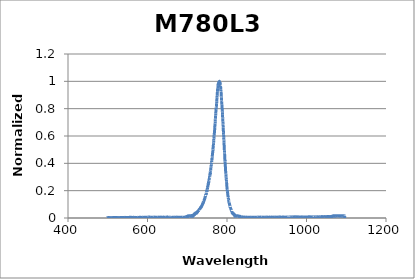
| Category | Normalized Intensity |
|---|---|
| 498.55860471 | 0.002 |
| 498.71212789 | 0.002 |
| 498.86566035 | 0.002 |
| 499.01920208 | 0.002 |
| 499.17275308 | 0.002 |
| 499.32631335 | 0.001 |
| 499.47988288 | 0.001 |
| 499.63346167 | 0.001 |
| 499.78704972 | 0.002 |
| 499.94064703 | 0.002 |
| 500.0942536 | 0.001 |
| 500.24786941 | 0.001 |
| 500.40149447 | 0.002 |
| 500.55512877 | 0.001 |
| 500.70877232 | 0.002 |
| 500.8624251 | 0.002 |
| 501.01608712 | 0.003 |
| 501.16975838 | 0.002 |
| 501.32343886 | 0.002 |
| 501.47712857 | 0.002 |
| 501.63082751 | 0.002 |
| 501.78453567 | 0.002 |
| 501.93825305 | 0.003 |
| 502.09197964 | 0.001 |
| 502.24571545 | 0.002 |
| 502.39946046 | 0.002 |
| 502.55321469 | 0.002 |
| 502.70697812 | 0.001 |
| 502.86075075 | 0.003 |
| 503.01453258 | 0.002 |
| 503.1683236 | 0.002 |
| 503.32212382 | 0.001 |
| 503.47593323 | 0.002 |
| 503.62975183 | 0.001 |
| 503.78357961 | 0.002 |
| 503.93741657 | 0.002 |
| 504.09126271 | 0.003 |
| 504.24511803 | 0.001 |
| 504.39898252 | 0.002 |
| 504.55285618 | 0.002 |
| 504.70673901 | 0.002 |
| 504.860631 | 0.001 |
| 505.01453216 | 0.003 |
| 505.16844247 | 0.002 |
| 505.32236194 | 0.003 |
| 505.47629056 | 0.001 |
| 505.63022834 | 0.003 |
| 505.78417526 | 0.002 |
| 505.93813132 | 0.001 |
| 506.09209653 | 0.002 |
| 506.24607088 | 0.003 |
| 506.40005436 | 0.001 |
| 506.55404697 | 0.001 |
| 506.70804872 | 0.002 |
| 506.86205959 | 0.003 |
| 507.01607959 | 0 |
| 507.17010871 | 0.002 |
| 507.32414695 | 0.002 |
| 507.4781943 | 0.002 |
| 507.63225077 | 0.003 |
| 507.78631635 | 0.001 |
| 507.94039103 | 0.001 |
| 508.09447482 | 0.002 |
| 508.24856771 | 0.002 |
| 508.4026697 | 0.002 |
| 508.55678079 | 0.001 |
| 508.71090097 | 0.002 |
| 508.86503024 | 0.001 |
| 509.0191686 | 0.002 |
| 509.17331604 | 0.002 |
| 509.32747256 | 0.002 |
| 509.48163816 | 0.002 |
| 509.63581284 | 0.002 |
| 509.78999659 | 0.003 |
| 509.94418942 | 0.003 |
| 510.09839131 | 0.003 |
| 510.25260226 | 0.002 |
| 510.40682228 | 0.002 |
| 510.56105135 | 0 |
| 510.71528948 | 0.001 |
| 510.86953666 | 0.002 |
| 511.0237929 | 0.002 |
| 511.17805818 | 0.002 |
| 511.33233251 | 0.002 |
| 511.48661587 | 0.002 |
| 511.64090828 | 0.001 |
| 511.79520972 | 0.002 |
| 511.9495202 | 0 |
| 512.1038397 | 0.002 |
| 512.25816824 | 0.002 |
| 512.4125058 | 0.003 |
| 512.56685237 | 0.002 |
| 512.72120797 | 0.003 |
| 512.87557259 | 0.003 |
| 513.02994622 | 0.004 |
| 513.18432885 | 0.001 |
| 513.3387205 | 0.002 |
| 513.49312115 | 0.002 |
| 513.6475308 | 0.002 |
| 513.80194945 | 0.002 |
| 513.9563771 | 0.002 |
| 514.11081374 | 0.002 |
| 514.26525937 | 0.002 |
| 514.41971399 | 0.001 |
| 514.57417759 | 0.002 |
| 514.72865017 | 0.002 |
| 514.88313173 | 0.003 |
| 515.03762227 | 0.001 |
| 515.19212178 | 0.002 |
| 515.34663027 | 0.001 |
| 515.50114772 | 0.002 |
| 515.65567413 | 0.002 |
| 515.81020951 | 0.003 |
| 515.96475384 | 0.002 |
| 516.11930713 | 0.003 |
| 516.27386937 | 0.002 |
| 516.42844057 | 0.003 |
| 516.58302071 | 0.003 |
| 516.7376098 | 0.002 |
| 516.89220782 | 0.002 |
| 517.04681479 | 0.002 |
| 517.20143069 | 0.002 |
| 517.35605553 | 0.001 |
| 517.51068929 | 0.001 |
| 517.66533199 | 0.002 |
| 517.81998361 | 0.003 |
| 517.97464415 | 0.001 |
| 518.1293136 | 0.002 |
| 518.28399198 | 0.002 |
| 518.43867927 | 0.001 |
| 518.59337546 | 0.002 |
| 518.74808057 | 0.001 |
| 518.90279458 | 0.001 |
| 519.05751749 | 0.002 |
| 519.2122493 | 0.003 |
| 519.36699001 | 0.001 |
| 519.52173961 | 0.003 |
| 519.6764981 | 0.002 |
| 519.83126547 | 0.004 |
| 519.98604174 | 0.003 |
| 520.14082688 | 0.001 |
| 520.2956209 | 0.001 |
| 520.4504238 | 0.002 |
| 520.60523557 | 0.004 |
| 520.76005621 | 0.003 |
| 520.91488572 | 0.001 |
| 521.06972409 | 0.003 |
| 521.22457133 | 0.002 |
| 521.37942742 | 0.003 |
| 521.53429237 | 0.002 |
| 521.68916618 | 0.002 |
| 521.84404883 | 0.002 |
| 521.99894033 | 0.002 |
| 522.15384068 | 0.001 |
| 522.30874986 | 0.001 |
| 522.46366789 | 0.003 |
| 522.61859475 | 0.002 |
| 522.77353045 | 0.002 |
| 522.92847497 | 0.003 |
| 523.08342833 | 0.002 |
| 523.2383905 | 0.003 |
| 523.3933615 | 0.002 |
| 523.54834132 | 0.002 |
| 523.70332995 | 0.003 |
| 523.8583274 | 0.003 |
| 524.01333366 | 0.002 |
| 524.16834872 | 0.002 |
| 524.32337259 | 0.002 |
| 524.47840526 | 0.003 |
| 524.63344673 | 0.002 |
| 524.788497 | 0.003 |
| 524.94355606 | 0.002 |
| 525.0986239 | 0.003 |
| 525.25370054 | 0 |
| 525.40878596 | 0.003 |
| 525.56388016 | 0.003 |
| 525.71898315 | 0.003 |
| 525.8740949 | 0.003 |
| 526.02921543 | 0.003 |
| 526.18434473 | 0.003 |
| 526.3394828 | 0.002 |
| 526.49462963 | 0.001 |
| 526.64978523 | 0.003 |
| 526.80494958 | 0 |
| 526.96012269 | 0.003 |
| 527.11530455 | 0.002 |
| 527.27049517 | 0.003 |
| 527.42569452 | 0.002 |
| 527.58090263 | 0.002 |
| 527.73611948 | 0.001 |
| 527.89134506 | 0.002 |
| 528.04657938 | 0.001 |
| 528.20182243 | 0.003 |
| 528.35707422 | 0.002 |
| 528.51233473 | 0.004 |
| 528.66760397 | 0.002 |
| 528.82288192 | 0.003 |
| 528.9781686 | 0 |
| 529.13346399 | 0.003 |
| 529.2887681 | 0.002 |
| 529.44408091 | 0.002 |
| 529.59940244 | 0.003 |
| 529.75473267 | 0.003 |
| 529.91007159 | 0.001 |
| 530.06541922 | 0.004 |
| 530.22077555 | 0.001 |
| 530.37614056 | 0.003 |
| 530.53151427 | 0.001 |
| 530.68689667 | 0.002 |
| 530.84228775 | 0.001 |
| 530.99768751 | 0.003 |
| 531.15309595 | 0.001 |
| 531.30851306 | 0.003 |
| 531.46393885 | 0.003 |
| 531.61937331 | 0.003 |
| 531.77481644 | 0.002 |
| 531.93026823 | 0.003 |
| 532.08572868 | 0.002 |
| 532.24119779 | 0.002 |
| 532.39667556 | 0.002 |
| 532.55216198 | 0.003 |
| 532.70765705 | 0.002 |
| 532.86316077 | 0.003 |
| 533.01867313 | 0.001 |
| 533.17419414 | 0.004 |
| 533.32972378 | 0.001 |
| 533.48526206 | 0.004 |
| 533.64080897 | 0.002 |
| 533.79636451 | 0.003 |
| 533.95192868 | 0.003 |
| 534.10750148 | 0.003 |
| 534.26308289 | 0.004 |
| 534.41867293 | 0.002 |
| 534.57427158 | 0.003 |
| 534.72987884 | 0 |
| 534.88549472 | 0.002 |
| 535.0411192 | 0.002 |
| 535.19675228 | 0.001 |
| 535.35239397 | 0.002 |
| 535.50804426 | 0.002 |
| 535.66370314 | 0.003 |
| 535.81937061 | 0.002 |
| 535.97504668 | 0.002 |
| 536.13073133 | 0.002 |
| 536.28642457 | 0.002 |
| 536.44212639 | 0.002 |
| 536.59783679 | 0.004 |
| 536.75355576 | 0.003 |
| 536.90928331 | 0.003 |
| 537.06501943 | 0.002 |
| 537.22076411 | 0.003 |
| 537.37651736 | 0.002 |
| 537.53227917 | 0.003 |
| 537.68804954 | 0.002 |
| 537.84382846 | 0.004 |
| 537.99961594 | 0.002 |
| 538.15541197 | 0.003 |
| 538.31121655 | 0.001 |
| 538.46702967 | 0.003 |
| 538.62285133 | 0.001 |
| 538.77868153 | 0.004 |
| 538.93452027 | 0.002 |
| 539.09036754 | 0.003 |
| 539.24622334 | 0.002 |
| 539.40208766 | 0.004 |
| 539.55796052 | 0.002 |
| 539.71384189 | 0.003 |
| 539.86973178 | 0.001 |
| 540.02563019 | 0.003 |
| 540.18153711 | 0 |
| 540.33745254 | 0.004 |
| 540.49337648 | 0.002 |
| 540.64930893 | 0.002 |
| 540.80524987 | 0.002 |
| 540.96119931 | 0.002 |
| 541.11715725 | 0.003 |
| 541.27312369 | 0.004 |
| 541.42909861 | 0.003 |
| 541.58508202 | 0.003 |
| 541.74107392 | 0.003 |
| 541.89707429 | 0.003 |
| 542.05308315 | 0.002 |
| 542.20910048 | 0.004 |
| 542.36512628 | 0.003 |
| 542.52116056 | 0.002 |
| 542.6772033 | 0.002 |
| 542.83325451 | 0.002 |
| 542.98931417 | 0.002 |
| 543.1453823 | 0.003 |
| 543.30145888 | 0.003 |
| 543.45754392 | 0.005 |
| 543.6136374 | 0.002 |
| 543.76973934 | 0.002 |
| 543.92584971 | 0.003 |
| 544.08196853 | 0.003 |
| 544.23809579 | 0.003 |
| 544.39423149 | 0.004 |
| 544.55037561 | 0.003 |
| 544.70652817 | 0.003 |
| 544.86268915 | 0.003 |
| 545.01885856 | 0.003 |
| 545.17503639 | 0.003 |
| 545.33122264 | 0.003 |
| 545.48741731 | 0.002 |
| 545.64362039 | 0.004 |
| 545.79983188 | 0.003 |
| 545.95605177 | 0.001 |
| 546.11228007 | 0.002 |
| 546.26851677 | 0.002 |
| 546.42476188 | 0.002 |
| 546.58101537 | 0.003 |
| 546.73727726 | 0.003 |
| 546.89354754 | 0.003 |
| 547.04982621 | 0.002 |
| 547.20611326 | 0.004 |
| 547.36240869 | 0.003 |
| 547.51871251 | 0.004 |
| 547.67502469 | 0.003 |
| 547.83134526 | 0.003 |
| 547.98767419 | 0.002 |
| 548.14401149 | 0.003 |
| 548.30035715 | 0.002 |
| 548.45671117 | 0.004 |
| 548.61307356 | 0.002 |
| 548.7694443 | 0.002 |
| 548.92582339 | 0.002 |
| 549.08221083 | 0.002 |
| 549.23860662 | 0.003 |
| 549.39501075 | 0.003 |
| 549.55142323 | 0.004 |
| 549.70784405 | 0.004 |
| 549.8642732 | 0.003 |
| 550.02071068 | 0.003 |
| 550.17715649 | 0.003 |
| 550.33361063 | 0.003 |
| 550.4900731 | 0.003 |
| 550.64654389 | 0.004 |
| 550.80302299 | 0.003 |
| 550.95951042 | 0.004 |
| 551.11600615 | 0.002 |
| 551.2725102 | 0.004 |
| 551.42902255 | 0.003 |
| 551.5855432 | 0.004 |
| 551.74207216 | 0.004 |
| 551.89860942 | 0.004 |
| 552.05515497 | 0.003 |
| 552.21170882 | 0.004 |
| 552.36827096 | 0.001 |
| 552.52484138 | 0.002 |
| 552.68142009 | 0.003 |
| 552.83800708 | 0.002 |
| 552.99460235 | 0.003 |
| 553.15120589 | 0.004 |
| 553.30781771 | 0.005 |
| 553.46443779 | 0.004 |
| 553.62106615 | 0.001 |
| 553.77770277 | 0.003 |
| 553.93434765 | 0.003 |
| 554.09100079 | 0.003 |
| 554.24766218 | 0.003 |
| 554.40433183 | 0.004 |
| 554.56100973 | 0.002 |
| 554.71769588 | 0.003 |
| 554.87439027 | 0.003 |
| 555.0310929 | 0.003 |
| 555.18780377 | 0.002 |
| 555.34452288 | 0.005 |
| 555.50125022 | 0.003 |
| 555.65798579 | 0.004 |
| 555.81472958 | 0.001 |
| 555.97148161 | 0.003 |
| 556.12824185 | 0.004 |
| 556.28501031 | 0.004 |
| 556.44178699 | 0.003 |
| 556.59857188 | 0.003 |
| 556.75536498 | 0.002 |
| 556.91216629 | 0.004 |
| 557.0689758 | 0.002 |
| 557.22579352 | 0.003 |
| 557.38261943 | 0.003 |
| 557.53945354 | 0.005 |
| 557.69629584 | 0.002 |
| 557.85314633 | 0.003 |
| 558.01000501 | 0.003 |
| 558.16687188 | 0.005 |
| 558.32374692 | 0.002 |
| 558.48063015 | 0.003 |
| 558.63752155 | 0.002 |
| 558.79442112 | 0.003 |
| 558.95132886 | 0.003 |
| 559.10824477 | 0.004 |
| 559.26516885 | 0.004 |
| 559.42210108 | 0.005 |
| 559.57904148 | 0.003 |
| 559.73599003 | 0.003 |
| 559.89294673 | 0.003 |
| 560.04991159 | 0.004 |
| 560.20688459 | 0.001 |
| 560.36386574 | 0.003 |
| 560.52085502 | 0.001 |
| 560.67785245 | 0.003 |
| 560.83485801 | 0.002 |
| 560.99187171 | 0.004 |
| 561.14889353 | 0.003 |
| 561.30592349 | 0.003 |
| 561.46296156 | 0.003 |
| 561.62000776 | 0.003 |
| 561.77706208 | 0.003 |
| 561.93412451 | 0.004 |
| 562.09119506 | 0.002 |
| 562.24827371 | 0.004 |
| 562.40536048 | 0.003 |
| 562.56245535 | 0.002 |
| 562.71955832 | 0.003 |
| 562.87666938 | 0.004 |
| 563.03378855 | 0.002 |
| 563.19091581 | 0.004 |
| 563.34805115 | 0.003 |
| 563.50519459 | 0.003 |
| 563.66234611 | 0.003 |
| 563.81950571 | 0.005 |
| 563.97667339 | 0.003 |
| 564.13384914 | 0.004 |
| 564.29103297 | 0.004 |
| 564.44822487 | 0.005 |
| 564.60542483 | 0.003 |
| 564.76263286 | 0.003 |
| 564.91984896 | 0.003 |
| 565.07707311 | 0.004 |
| 565.23430531 | 0.003 |
| 565.39154557 | 0.003 |
| 565.54879388 | 0.002 |
| 565.70605024 | 0.005 |
| 565.86331464 | 0.002 |
| 566.02058708 | 0.003 |
| 566.17786756 | 0.003 |
| 566.33515608 | 0.004 |
| 566.49245263 | 0.002 |
| 566.64975721 | 0.004 |
| 566.80706982 | 0.003 |
| 566.96439045 | 0.004 |
| 567.1217191 | 0.003 |
| 567.27905578 | 0.004 |
| 567.43640046 | 0.002 |
| 567.59375316 | 0.004 |
| 567.75111388 | 0.002 |
| 567.90848259 | 0.004 |
| 568.06585932 | 0.003 |
| 568.22324404 | 0.004 |
| 568.38063676 | 0.003 |
| 568.53803748 | 0.003 |
| 568.6954462 | 0.003 |
| 568.8528629 | 0.005 |
| 569.01028759 | 0.002 |
| 569.16772026 | 0.004 |
| 569.32516092 | 0.004 |
| 569.48260955 | 0.003 |
| 569.64006616 | 0.003 |
| 569.79753074 | 0.005 |
| 569.9550033 | 0.002 |
| 570.11248382 | 0.004 |
| 570.2699723 | 0.003 |
| 570.42746875 | 0.004 |
| 570.58497315 | 0.003 |
| 570.74248551 | 0.005 |
| 570.90000583 | 0.002 |
| 571.05753409 | 0.004 |
| 571.2150703 | 0.004 |
| 571.37261446 | 0.004 |
| 571.53016655 | 0.003 |
| 571.68772659 | 0.004 |
| 571.84529456 | 0.002 |
| 572.00287047 | 0.004 |
| 572.1604543 | 0.003 |
| 572.31804606 | 0.005 |
| 572.47564575 | 0.002 |
| 572.63325336 | 0.004 |
| 572.79086888 | 0.003 |
| 572.94849232 | 0.004 |
| 573.10612368 | 0.002 |
| 573.26376295 | 0.003 |
| 573.42141012 | 0.002 |
| 573.5790652 | 0.003 |
| 573.73672817 | 0.004 |
| 573.89439905 | 0.003 |
| 574.05207782 | 0.003 |
| 574.20976449 | 0.003 |
| 574.36745905 | 0.002 |
| 574.52516149 | 0.004 |
| 574.68287182 | 0.004 |
| 574.84059003 | 0.004 |
| 574.99831612 | 0.003 |
| 575.15605008 | 0.003 |
| 575.31379192 | 0.002 |
| 575.47154162 | 0.002 |
| 575.6292992 | 0.004 |
| 575.78706464 | 0.004 |
| 575.94483794 | 0.003 |
| 576.1026191 | 0.002 |
| 576.26040811 | 0.003 |
| 576.41820498 | 0.004 |
| 576.5760097 | 0.002 |
| 576.73382226 | 0.002 |
| 576.89164267 | 0.003 |
| 577.04947092 | 0.004 |
| 577.20730701 | 0.004 |
| 577.36515094 | 0.004 |
| 577.52300269 | 0.003 |
| 577.68086228 | 0.005 |
| 577.8387297 | 0.003 |
| 577.99660494 | 0.004 |
| 578.154488 | 0.003 |
| 578.31237888 | 0.003 |
| 578.47027758 | 0.002 |
| 578.62818409 | 0.004 |
| 578.7860984 | 0.003 |
| 578.94402053 | 0.004 |
| 579.10195046 | 0.003 |
| 579.25988819 | 0.004 |
| 579.41783373 | 0.003 |
| 579.57578705 | 0.005 |
| 579.73374817 | 0.004 |
| 579.89171708 | 0.005 |
| 580.04969378 | 0.003 |
| 580.20767826 | 0.005 |
| 580.36567052 | 0.003 |
| 580.52367056 | 0.005 |
| 580.68167838 | 0.003 |
| 580.83969397 | 0.004 |
| 580.99771733 | 0.004 |
| 581.15574846 | 0.004 |
| 581.31378735 | 0.003 |
| 581.47183401 | 0.005 |
| 581.62988842 | 0.003 |
| 581.78795059 | 0.004 |
| 581.94602051 | 0.004 |
| 582.10409818 | 0.005 |
| 582.2621836 | 0.004 |
| 582.42027676 | 0.004 |
| 582.57837766 | 0.004 |
| 582.73648631 | 0.003 |
| 582.89460269 | 0.003 |
| 583.0527268 | 0.005 |
| 583.21085864 | 0.003 |
| 583.36899821 | 0.004 |
| 583.5271455 | 0.004 |
| 583.68530052 | 0.003 |
| 583.84346325 | 0.004 |
| 584.0016337 | 0.003 |
| 584.15981186 | 0.002 |
| 584.31799773 | 0.004 |
| 584.47619131 | 0.002 |
| 584.6343926 | 0.003 |
| 584.79260158 | 0.003 |
| 584.95081827 | 0.004 |
| 585.10904265 | 0.003 |
| 585.26727472 | 0.004 |
| 585.42551448 | 0.002 |
| 585.58376193 | 0.003 |
| 585.74201707 | 0.003 |
| 585.90027988 | 0.005 |
| 586.05855038 | 0.003 |
| 586.21682855 | 0.003 |
| 586.37511439 | 0.004 |
| 586.5334079 | 0.004 |
| 586.69170908 | 0.004 |
| 586.85001793 | 0.004 |
| 587.00833444 | 0.003 |
| 587.1666586 | 0.005 |
| 587.32499042 | 0.005 |
| 587.4833299 | 0.004 |
| 587.64167702 | 0.005 |
| 587.80003179 | 0.006 |
| 587.95839421 | 0.003 |
| 588.11676426 | 0.004 |
| 588.27514196 | 0.004 |
| 588.43352729 | 0.005 |
| 588.59192025 | 0.003 |
| 588.75032085 | 0.004 |
| 588.90872907 | 0.004 |
| 589.06714492 | 0.003 |
| 589.22556838 | 0.004 |
| 589.38399947 | 0.005 |
| 589.54243817 | 0.003 |
| 589.70088449 | 0.004 |
| 589.85933841 | 0.003 |
| 590.01779994 | 0.003 |
| 590.17626908 | 0.003 |
| 590.33474582 | 0.006 |
| 590.49323015 | 0.002 |
| 590.65172209 | 0.003 |
| 590.81022161 | 0.003 |
| 590.96872873 | 0.004 |
| 591.12724343 | 0.003 |
| 591.28576572 | 0.005 |
| 591.44429559 | 0.003 |
| 591.60283303 | 0.002 |
| 591.76137806 | 0.004 |
| 591.91993065 | 0.005 |
| 592.07849082 | 0.004 |
| 592.23705855 | 0.005 |
| 592.39563385 | 0.002 |
| 592.55421671 | 0.004 |
| 592.71280712 | 0.003 |
| 592.8714051 | 0.003 |
| 593.03001062 | 0.005 |
| 593.1886237 | 0.004 |
| 593.34724432 | 0.004 |
| 593.50587249 | 0.004 |
| 593.6645082 | 0.003 |
| 593.82315145 | 0.005 |
| 593.98180223 | 0.003 |
| 594.14046055 | 0.004 |
| 594.29912639 | 0.004 |
| 594.45779977 | 0.005 |
| 594.61648067 | 0.004 |
| 594.77516909 | 0.004 |
| 594.93386502 | 0.004 |
| 595.09256848 | 0.005 |
| 595.25127944 | 0.003 |
| 595.40999792 | 0.005 |
| 595.56872391 | 0.003 |
| 595.72745739 | 0.003 |
| 595.88619838 | 0.004 |
| 596.04494687 | 0.005 |
| 596.20370286 | 0.004 |
| 596.36246633 | 0.005 |
| 596.5212373 | 0.004 |
| 596.68001576 | 0.005 |
| 596.83880169 | 0.003 |
| 596.99759511 | 0.004 |
| 597.15639601 | 0.004 |
| 597.31520439 | 0.003 |
| 597.47402024 | 0.004 |
| 597.63284355 | 0.005 |
| 597.79167434 | 0.003 |
| 597.95051259 | 0.005 |
| 598.1093583 | 0.004 |
| 598.26821147 | 0.005 |
| 598.42707209 | 0.004 |
| 598.58594017 | 0.003 |
| 598.7448157 | 0.004 |
| 598.90369867 | 0.004 |
| 599.06258909 | 0.004 |
| 599.22148695 | 0.005 |
| 599.38039225 | 0.004 |
| 599.53930499 | 0.004 |
| 599.69822516 | 0.003 |
| 599.85715275 | 0.005 |
| 600.01608778 | 0.003 |
| 600.17503023 | 0.005 |
| 600.3339801 | 0.005 |
| 600.49293739 | 0.005 |
| 600.6519021 | 0.003 |
| 600.81087421 | 0.003 |
| 600.96985374 | 0.004 |
| 601.12884068 | 0.005 |
| 601.28783502 | 0.004 |
| 601.44683676 | 0.004 |
| 601.6058459 | 0.004 |
| 601.76486243 | 0.005 |
| 601.92388636 | 0.003 |
| 602.08291768 | 0.004 |
| 602.24195639 | 0.005 |
| 602.40100248 | 0.007 |
| 602.56005595 | 0.002 |
| 602.7191168 | 0.005 |
| 602.87818503 | 0.005 |
| 603.03726062 | 0.007 |
| 603.19634359 | 0.003 |
| 603.35543393 | 0.005 |
| 603.51453163 | 0.003 |
| 603.67363669 | 0.005 |
| 603.83274911 | 0.003 |
| 603.99186889 | 0.004 |
| 604.15099602 | 0.003 |
| 604.3101305 | 0.005 |
| 604.46927232 | 0.004 |
| 604.62842149 | 0.006 |
| 604.787578 | 0.004 |
| 604.94674185 | 0.006 |
| 605.10591304 | 0.003 |
| 605.26509156 | 0.006 |
| 605.42427741 | 0.004 |
| 605.58347059 | 0.006 |
| 605.74267109 | 0.004 |
| 605.90187891 | 0.005 |
| 606.06109405 | 0.004 |
| 606.22031651 | 0.004 |
| 606.37954628 | 0.005 |
| 606.53878335 | 0.003 |
| 606.69802774 | 0.005 |
| 606.85727943 | 0.006 |
| 607.01653842 | 0.003 |
| 607.17580471 | 0.005 |
| 607.3350783 | 0.004 |
| 607.49435918 | 0.003 |
| 607.65364735 | 0.004 |
| 607.81294281 | 0.004 |
| 607.97224555 | 0.003 |
| 608.13155557 | 0.004 |
| 608.29087287 | 0.003 |
| 608.45019745 | 0.004 |
| 608.6095293 | 0.004 |
| 608.76886842 | 0.005 |
| 608.9282148 | 0.005 |
| 609.08756845 | 0.005 |
| 609.24692937 | 0.005 |
| 609.40629754 | 0.006 |
| 609.56567296 | 0.005 |
| 609.72505564 | 0.006 |
| 609.88444557 | 0.004 |
| 610.04384275 | 0.004 |
| 610.20324717 | 0.004 |
| 610.36265883 | 0.005 |
| 610.52207774 | 0.003 |
| 610.68150387 | 0.005 |
| 610.84093724 | 0.004 |
| 611.00037784 | 0.006 |
| 611.15982567 | 0.004 |
| 611.31928072 | 0.004 |
| 611.47874299 | 0.005 |
| 611.63821248 | 0.004 |
| 611.79768919 | 0.003 |
| 611.95717311 | 0.005 |
| 612.11666424 | 0.003 |
| 612.27616258 | 0.004 |
| 612.43566812 | 0.004 |
| 612.59518086 | 0.005 |
| 612.7547008 | 0.003 |
| 612.91422794 | 0.006 |
| 613.07376227 | 0.004 |
| 613.23330379 | 0.004 |
| 613.39285249 | 0.003 |
| 613.55240839 | 0.004 |
| 613.71197146 | 0.006 |
| 613.87154171 | 0.005 |
| 614.03111914 | 0.005 |
| 614.19070374 | 0.005 |
| 614.35029551 | 0.004 |
| 614.50989444 | 0.005 |
| 614.66950054 | 0.005 |
| 614.82911381 | 0.004 |
| 614.98873423 | 0.004 |
| 615.1483618 | 0.005 |
| 615.30799653 | 0.004 |
| 615.46763841 | 0.005 |
| 615.62728744 | 0.004 |
| 615.78694361 | 0.006 |
| 615.94660692 | 0.004 |
| 616.10627737 | 0.005 |
| 616.26595496 | 0.004 |
| 616.42563968 | 0.005 |
| 616.58533153 | 0.004 |
| 616.74503051 | 0.005 |
| 616.90473661 | 0.003 |
| 617.06444983 | 0.007 |
| 617.22417017 | 0.003 |
| 617.38389763 | 0.005 |
| 617.5436322 | 0.003 |
| 617.70337388 | 0.006 |
| 617.86312266 | 0.003 |
| 618.02287855 | 0.006 |
| 618.18264155 | 0.004 |
| 618.34241164 | 0.006 |
| 618.50218882 | 0.004 |
| 618.6619731 | 0.004 |
| 618.82176447 | 0.005 |
| 618.98156293 | 0.004 |
| 619.14136847 | 0.003 |
| 619.30118109 | 0.003 |
| 619.46100079 | 0.005 |
| 619.62082757 | 0.005 |
| 619.78066142 | 0.003 |
| 619.94050234 | 0.003 |
| 620.10035033 | 0.005 |
| 620.26020538 | 0.004 |
| 620.42006749 | 0.005 |
| 620.57993666 | 0.005 |
| 620.73981288 | 0.004 |
| 620.89969616 | 0.004 |
| 621.05958649 | 0.005 |
| 621.21948387 | 0.005 |
| 621.37938829 | 0.004 |
| 621.53929975 | 0.006 |
| 621.69921825 | 0.004 |
| 621.85914379 | 0.005 |
| 622.01907636 | 0.004 |
| 622.17901596 | 0.005 |
| 622.33896258 | 0.004 |
| 622.49891623 | 0.005 |
| 622.6588769 | 0.004 |
| 622.8188446 | 0.004 |
| 622.9788193 | 0.003 |
| 623.13880102 | 0.005 |
| 623.29878975 | 0.003 |
| 623.45878548 | 0.005 |
| 623.61878822 | 0.004 |
| 623.77879797 | 0.005 |
| 623.93881471 | 0.004 |
| 624.09883844 | 0.006 |
| 624.25886917 | 0.004 |
| 624.41890689 | 0.005 |
| 624.57895159 | 0.004 |
| 624.73900328 | 0.005 |
| 624.89906196 | 0.004 |
| 625.05912761 | 0.003 |
| 625.21920023 | 0.004 |
| 625.37927983 | 0.006 |
| 625.5393664 | 0.004 |
| 625.69945993 | 0.005 |
| 625.85956043 | 0.004 |
| 626.01966789 | 0.006 |
| 626.17978231 | 0.004 |
| 626.33990369 | 0.005 |
| 626.50003202 | 0.004 |
| 626.6601673 | 0.005 |
| 626.82030952 | 0.004 |
| 626.98045869 | 0.006 |
| 627.1406148 | 0.004 |
| 627.30077785 | 0.006 |
| 627.46094784 | 0.002 |
| 627.62112475 | 0.004 |
| 627.7813086 | 0.003 |
| 627.94149938 | 0.006 |
| 628.10169707 | 0.003 |
| 628.2619017 | 0.004 |
| 628.42211323 | 0.005 |
| 628.58233169 | 0.004 |
| 628.74255706 | 0.003 |
| 628.90278933 | 0.005 |
| 629.06302852 | 0.005 |
| 629.22327461 | 0.005 |
| 629.3835276 | 0.004 |
| 629.54378749 | 0.004 |
| 629.70405427 | 0.003 |
| 629.86432795 | 0.005 |
| 630.02460852 | 0.005 |
| 630.18489597 | 0.004 |
| 630.34519031 | 0.003 |
| 630.50549153 | 0.005 |
| 630.66579963 | 0.004 |
| 630.8261146 | 0.004 |
| 630.98643645 | 0.004 |
| 631.14676516 | 0.003 |
| 631.30710075 | 0.004 |
| 631.4674432 | 0.006 |
| 631.62779251 | 0.005 |
| 631.78814867 | 0.006 |
| 631.9485117 | 0.004 |
| 632.10888157 | 0.005 |
| 632.2692583 | 0.004 |
| 632.42964187 | 0.006 |
| 632.59003229 | 0.003 |
| 632.75042955 | 0.005 |
| 632.91083365 | 0.004 |
| 633.07124458 | 0.006 |
| 633.23166235 | 0.004 |
| 633.39208694 | 0.005 |
| 633.55251837 | 0.003 |
| 633.71295661 | 0.005 |
| 633.87340168 | 0.004 |
| 634.03385357 | 0.005 |
| 634.19431227 | 0.005 |
| 634.35477779 | 0.006 |
| 634.51525011 | 0.005 |
| 634.67572925 | 0.005 |
| 634.83621518 | 0.004 |
| 634.99670792 | 0.005 |
| 635.15720746 | 0.004 |
| 635.31771379 | 0.005 |
| 635.47822692 | 0.003 |
| 635.63874683 | 0.005 |
| 635.79927353 | 0.003 |
| 635.95980702 | 0.004 |
| 636.12034729 | 0.004 |
| 636.28089434 | 0.005 |
| 636.44144816 | 0.004 |
| 636.60200875 | 0.004 |
| 636.76257612 | 0.004 |
| 636.92315025 | 0.005 |
| 637.08373114 | 0.004 |
| 637.2443188 | 0.005 |
| 637.40491322 | 0.004 |
| 637.56551439 | 0.005 |
| 637.72612231 | 0.004 |
| 637.88673699 | 0.005 |
| 638.04735841 | 0.003 |
| 638.20798657 | 0.005 |
| 638.36862148 | 0.004 |
| 638.52926313 | 0.005 |
| 638.68991151 | 0.004 |
| 638.85056662 | 0.006 |
| 639.01122847 | 0.005 |
| 639.17189704 | 0.007 |
| 639.33257233 | 0.003 |
| 639.49325435 | 0.005 |
| 639.65394308 | 0.003 |
| 639.81463853 | 0.006 |
| 639.9753407 | 0.003 |
| 640.13604957 | 0.005 |
| 640.29676515 | 0.003 |
| 640.45748743 | 0.003 |
| 640.61821642 | 0.002 |
| 640.7789521 | 0.004 |
| 640.93969448 | 0.003 |
| 641.10044356 | 0.007 |
| 641.26119932 | 0.003 |
| 641.42196177 | 0.005 |
| 641.5827309 | 0.004 |
| 641.74350672 | 0.006 |
| 641.90428921 | 0.006 |
| 642.06507838 | 0.005 |
| 642.22587422 | 0.003 |
| 642.38667674 | 0.005 |
| 642.54748592 | 0.004 |
| 642.70830176 | 0.004 |
| 642.86912426 | 0.004 |
| 643.02995343 | 0.005 |
| 643.19078925 | 0.004 |
| 643.35163172 | 0.005 |
| 643.51248084 | 0.003 |
| 643.67333661 | 0.003 |
| 643.83419902 | 0.003 |
| 643.99506807 | 0.006 |
| 644.15594377 | 0.004 |
| 644.3168261 | 0.006 |
| 644.47771506 | 0.004 |
| 644.63861065 | 0.006 |
| 644.79951287 | 0.004 |
| 644.96042171 | 0.005 |
| 645.12133717 | 0.004 |
| 645.28225925 | 0.004 |
| 645.44318795 | 0.005 |
| 645.60412326 | 0.004 |
| 645.76506518 | 0.003 |
| 645.92601371 | 0.004 |
| 646.08696884 | 0.005 |
| 646.24793057 | 0.005 |
| 646.4088989 | 0.004 |
| 646.56987383 | 0.005 |
| 646.73085535 | 0.004 |
| 646.89184346 | 0.004 |
| 647.05283816 | 0.003 |
| 647.21383944 | 0.004 |
| 647.3748473 | 0.003 |
| 647.53586174 | 0.004 |
| 647.69688276 | 0.004 |
| 647.85791035 | 0.005 |
| 648.0189445 | 0.004 |
| 648.17998523 | 0.005 |
| 648.34103252 | 0.003 |
| 648.50208637 | 0.004 |
| 648.66314678 | 0.004 |
| 648.82421375 | 0.008 |
| 648.98528727 | 0.004 |
| 649.14636733 | 0.005 |
| 649.30745395 | 0.005 |
| 649.46854711 | 0.007 |
| 649.62964681 | 0.004 |
| 649.79075305 | 0.006 |
| 649.95186582 | 0.003 |
| 650.11298513 | 0.004 |
| 650.27411097 | 0.004 |
| 650.43524333 | 0.005 |
| 650.59638222 | 0.004 |
| 650.75752763 | 0.007 |
| 650.91867956 | 0.004 |
| 651.079838 | 0.006 |
| 651.24100296 | 0.003 |
| 651.40217443 | 0.006 |
| 651.5633524 | 0.003 |
| 651.72453688 | 0.006 |
| 651.88572786 | 0.005 |
| 652.04692534 | 0.005 |
| 652.20812931 | 0.003 |
| 652.36933978 | 0.004 |
| 652.53055673 | 0.003 |
| 652.69178018 | 0.004 |
| 652.8530101 | 0.004 |
| 653.01424651 | 0.005 |
| 653.1754894 | 0.003 |
| 653.33673876 | 0.004 |
| 653.4979946 | 0.003 |
| 653.6592569 | 0.005 |
| 653.82052567 | 0.004 |
| 653.98180091 | 0.004 |
| 654.14308261 | 0.003 |
| 654.30437076 | 0.005 |
| 654.46566538 | 0.005 |
| 654.62696644 | 0.005 |
| 654.78827395 | 0.004 |
| 654.94958792 | 0.004 |
| 655.11090832 | 0.004 |
| 655.27223517 | 0.004 |
| 655.43356845 | 0.005 |
| 655.59490817 | 0.003 |
| 655.75625433 | 0.005 |
| 655.91760691 | 0.004 |
| 656.07896592 | 0.005 |
| 656.24033136 | 0.003 |
| 656.40170321 | 0.004 |
| 656.56308149 | 0.007 |
| 656.72446618 | 0.004 |
| 656.88585728 | 0.004 |
| 657.04725479 | 0.005 |
| 657.20865871 | 0.003 |
| 657.37006904 | 0.005 |
| 657.53148576 | 0.004 |
| 657.69290888 | 0.004 |
| 657.8543384 | 0.005 |
| 658.01577432 | 0.004 |
| 658.17721662 | 0.004 |
| 658.33866531 | 0.004 |
| 658.50012038 | 0.003 |
| 658.66158183 | 0.005 |
| 658.82304967 | 0.004 |
| 658.98452387 | 0.005 |
| 659.14600446 | 0.004 |
| 659.30749141 | 0.004 |
| 659.46898472 | 0.003 |
| 659.63048441 | 0.004 |
| 659.79199045 | 0.003 |
| 659.95350285 | 0.005 |
| 660.11502161 | 0.004 |
| 660.27654672 | 0.004 |
| 660.43807818 | 0.004 |
| 660.59961599 | 0.007 |
| 660.76116014 | 0.004 |
| 660.92271063 | 0.004 |
| 661.08426746 | 0.005 |
| 661.24583063 | 0.004 |
| 661.40740013 | 0.004 |
| 661.56897596 | 0.004 |
| 661.73055811 | 0.004 |
| 661.89214659 | 0.004 |
| 662.05374139 | 0.005 |
| 662.21534251 | 0.004 |
| 662.37694995 | 0.004 |
| 662.5385637 | 0.003 |
| 662.70018375 | 0.005 |
| 662.86181012 | 0.003 |
| 663.02344279 | 0.005 |
| 663.18508176 | 0.005 |
| 663.34672703 | 0.003 |
| 663.50837859 | 0.004 |
| 663.67003645 | 0.004 |
| 663.8317006 | 0.004 |
| 663.99337103 | 0.004 |
| 664.15504775 | 0.006 |
| 664.31673075 | 0.004 |
| 664.47842003 | 0.005 |
| 664.64011558 | 0.004 |
| 664.80181741 | 0.003 |
| 664.9635255 | 0.004 |
| 665.12523986 | 0.004 |
| 665.28696049 | 0.005 |
| 665.44868738 | 0.005 |
| 665.61042053 | 0.004 |
| 665.77215993 | 0.005 |
| 665.93390559 | 0.004 |
| 666.09565749 | 0.004 |
| 666.25741564 | 0.004 |
| 666.41918004 | 0.005 |
| 666.58095068 | 0.006 |
| 666.74272755 | 0.004 |
| 666.90451066 | 0.003 |
| 667.06630001 | 0.004 |
| 667.22809558 | 0.004 |
| 667.38989738 | 0.005 |
| 667.55170541 | 0.004 |
| 667.71351965 | 0.006 |
| 667.87534012 | 0.004 |
| 668.0371668 | 0.004 |
| 668.19899969 | 0.004 |
| 668.36083879 | 0.003 |
| 668.5226841 | 0.004 |
| 668.68453562 | 0.004 |
| 668.84639333 | 0.004 |
| 669.00825725 | 0.007 |
| 669.17012736 | 0.004 |
| 669.33200366 | 0.005 |
| 669.49388615 | 0.004 |
| 669.65577483 | 0.005 |
| 669.81766969 | 0.005 |
| 669.97957074 | 0.003 |
| 670.14147796 | 0.004 |
| 670.30339136 | 0.004 |
| 670.46531093 | 0.004 |
| 670.62723667 | 0.004 |
| 670.78916858 | 0.004 |
| 670.95110665 | 0.004 |
| 671.11305088 | 0.004 |
| 671.27500127 | 0.003 |
| 671.43695782 | 0.004 |
| 671.59892052 | 0.004 |
| 671.76088937 | 0.003 |
| 671.92286436 | 0.006 |
| 672.0848455 | 0.004 |
| 672.24683279 | 0.004 |
| 672.40882621 | 0.004 |
| 672.57082576 | 0.004 |
| 672.73283145 | 0.004 |
| 672.89484327 | 0.004 |
| 673.05686121 | 0.005 |
| 673.21888528 | 0.005 |
| 673.38091547 | 0.003 |
| 673.54295178 | 0.005 |
| 673.70499421 | 0.003 |
| 673.86704275 | 0.004 |
| 674.02909739 | 0.007 |
| 674.19115815 | 0.005 |
| 674.353225 | 0.005 |
| 674.51529796 | 0.004 |
| 674.67737702 | 0.003 |
| 674.83946218 | 0.004 |
| 675.00155342 | 0.003 |
| 675.16365076 | 0.005 |
| 675.32575418 | 0.004 |
| 675.48786369 | 0.005 |
| 675.64997928 | 0.004 |
| 675.81210094 | 0.003 |
| 675.97422868 | 0.004 |
| 676.1363625 | 0.004 |
| 676.29850238 | 0.004 |
| 676.46064834 | 0.004 |
| 676.62280035 | 0.005 |
| 676.78495843 | 0.003 |
| 676.94712256 | 0.005 |
| 677.10929275 | 0.005 |
| 677.271469 | 0.004 |
| 677.43365129 | 0.004 |
| 677.59583963 | 0.003 |
| 677.75803402 | 0.004 |
| 677.92023444 | 0.003 |
| 678.08244091 | 0.003 |
| 678.24465341 | 0.003 |
| 678.40687194 | 0.005 |
| 678.5690965 | 0.004 |
| 678.73132709 | 0.004 |
| 678.8935637 | 0.003 |
| 679.05580634 | 0.004 |
| 679.21805499 | 0.005 |
| 679.38030966 | 0.003 |
| 679.54257034 | 0.004 |
| 679.70483703 | 0.003 |
| 679.86710973 | 0.004 |
| 680.02938843 | 0.004 |
| 680.19167313 | 0.005 |
| 680.35396383 | 0.005 |
| 680.51626053 | 0.004 |
| 680.67856322 | 0.005 |
| 680.8408719 | 0.002 |
| 681.00318657 | 0.004 |
| 681.16550722 | 0.003 |
| 681.32783385 | 0.004 |
| 681.49016646 | 0.003 |
| 681.65250504 | 0.005 |
| 681.8148496 | 0.004 |
| 681.97720013 | 0.003 |
| 682.13955663 | 0.005 |
| 682.30191909 | 0.005 |
| 682.46428751 | 0.004 |
| 682.62666188 | 0.004 |
| 682.78904222 | 0.004 |
| 682.95142851 | 0.003 |
| 683.11382074 | 0.003 |
| 683.27621893 | 0.003 |
| 683.43862305 | 0.004 |
| 683.60103312 | 0.005 |
| 683.76344913 | 0.005 |
| 683.92587107 | 0.005 |
| 684.08829895 | 0.003 |
| 684.25073275 | 0.004 |
| 684.41317249 | 0.004 |
| 684.57561814 | 0.004 |
| 684.73806972 | 0.002 |
| 684.90052722 | 0.006 |
| 685.06299063 | 0.004 |
| 685.22545995 | 0.005 |
| 685.38793519 | 0.005 |
| 685.55041633 | 0.004 |
| 685.71290337 | 0.004 |
| 685.87539632 | 0.005 |
| 686.03789516 | 0.005 |
| 686.2003999 | 0.005 |
| 686.36291054 | 0.004 |
| 686.52542706 | 0.005 |
| 686.68794947 | 0.003 |
| 686.85047776 | 0.004 |
| 687.01301194 | 0.003 |
| 687.17555199 | 0.004 |
| 687.33809792 | 0.005 |
| 687.50064972 | 0.005 |
| 687.66320739 | 0.005 |
| 687.82577093 | 0.004 |
| 687.98834033 | 0.005 |
| 688.15091559 | 0.005 |
| 688.31349672 | 0.005 |
| 688.47608369 | 0.005 |
| 688.63867652 | 0.005 |
| 688.8012752 | 0.005 |
| 688.96387973 | 0.004 |
| 689.1264901 | 0.005 |
| 689.28910631 | 0.004 |
| 689.45172836 | 0.004 |
| 689.61435625 | 0.003 |
| 689.77698997 | 0.004 |
| 689.93962951 | 0.003 |
| 690.10227489 | 0.005 |
| 690.26492609 | 0.004 |
| 690.42758311 | 0.004 |
| 690.59024595 | 0.004 |
| 690.7529146 | 0.005 |
| 690.91558907 | 0.005 |
| 691.07826934 | 0.006 |
| 691.24095543 | 0.004 |
| 691.40364732 | 0.005 |
| 691.566345 | 0.004 |
| 691.72904849 | 0.004 |
| 691.89175777 | 0.003 |
| 692.05447285 | 0.005 |
| 692.21719371 | 0.005 |
| 692.37992037 | 0.006 |
| 692.5426528 | 0.005 |
| 692.70539102 | 0.005 |
| 692.86813501 | 0.006 |
| 693.03088479 | 0.006 |
| 693.19364033 | 0.004 |
| 693.35640164 | 0.006 |
| 693.51916872 | 0.004 |
| 693.68194157 | 0.006 |
| 693.84472017 | 0.004 |
| 694.00750454 | 0.005 |
| 694.17029466 | 0.006 |
| 694.33309053 | 0.004 |
| 694.49589215 | 0.005 |
| 694.65869952 | 0.006 |
| 694.82151263 | 0.005 |
| 694.98433149 | 0.007 |
| 695.14715608 | 0.005 |
| 695.30998641 | 0.005 |
| 695.47282247 | 0.006 |
| 695.63566426 | 0.006 |
| 695.79851177 | 0.007 |
| 695.96136502 | 0.007 |
| 696.12422398 | 0.005 |
| 696.28708866 | 0.007 |
| 696.44995905 | 0.007 |
| 696.61283516 | 0.006 |
| 696.77571698 | 0.007 |
| 696.93860451 | 0.006 |
| 697.10149774 | 0.009 |
| 697.26439667 | 0.007 |
| 697.4273013 | 0.006 |
| 697.59021162 | 0.005 |
| 697.75312764 | 0.008 |
| 697.91604935 | 0.006 |
| 698.07897674 | 0.009 |
| 698.24190982 | 0.007 |
| 698.40484858 | 0.008 |
| 698.56779301 | 0.007 |
| 698.73074313 | 0.011 |
| 698.89369891 | 0.007 |
| 699.05666037 | 0.009 |
| 699.21962749 | 0.008 |
| 699.38260028 | 0.012 |
| 699.54557872 | 0.009 |
| 699.70856283 | 0.011 |
| 699.87155259 | 0.009 |
| 700.034548 | 0.012 |
| 700.19754907 | 0.008 |
| 700.36055578 | 0.011 |
| 700.52356813 | 0.013 |
| 700.68658613 | 0.012 |
| 700.84960976 | 0.013 |
| 701.01263903 | 0.011 |
| 701.17567393 | 0.011 |
| 701.33871447 | 0.014 |
| 701.50176062 | 0.013 |
| 701.66481241 | 0.013 |
| 701.82786981 | 0.013 |
| 701.99093283 | 0.014 |
| 702.15400147 | 0.011 |
| 702.31707572 | 0.014 |
| 702.48015558 | 0.012 |
| 702.64324105 | 0.014 |
| 702.80633212 | 0.013 |
| 702.96942879 | 0.015 |
| 703.13253106 | 0.011 |
| 703.29563893 | 0.015 |
| 703.45875239 | 0.015 |
| 703.62187143 | 0.015 |
| 703.78499607 | 0.015 |
| 703.94812629 | 0.015 |
| 704.11126209 | 0.015 |
| 704.27440347 | 0.015 |
| 704.43755042 | 0.015 |
| 704.60070295 | 0.015 |
| 704.76386105 | 0.015 |
| 704.92702471 | 0.015 |
| 705.09019394 | 0.016 |
| 705.25336873 | 0.015 |
| 705.41654907 | 0.015 |
| 705.57973497 | 0.015 |
| 705.74292643 | 0.016 |
| 705.90612343 | 0.015 |
| 706.06932599 | 0.016 |
| 706.23253408 | 0.015 |
| 706.39574772 | 0.016 |
| 706.55896689 | 0.015 |
| 706.7221916 | 0.016 |
| 706.88542185 | 0.014 |
| 707.04865762 | 0.016 |
| 707.21189892 | 0.014 |
| 707.37514574 | 0.016 |
| 707.53839809 | 0.014 |
| 707.70165595 | 0.016 |
| 707.86491933 | 0.014 |
| 708.02818822 | 0.016 |
| 708.19146262 | 0.014 |
| 708.35474253 | 0.016 |
| 708.51802794 | 0.014 |
| 708.68131886 | 0.015 |
| 708.84461527 | 0.014 |
| 709.00791717 | 0.016 |
| 709.17122457 | 0.014 |
| 709.33453746 | 0.017 |
| 709.49785584 | 0.014 |
| 709.6611797 | 0.016 |
| 709.82450904 | 0.014 |
| 709.98784386 | 0.016 |
| 710.15118415 | 0.014 |
| 710.31452992 | 0.017 |
| 710.47788116 | 0.016 |
| 710.64123786 | 0.017 |
| 710.80460003 | 0.014 |
| 710.96796766 | 0.017 |
| 711.13134075 | 0.017 |
| 711.29471929 | 0.018 |
| 711.45810329 | 0.016 |
| 711.62149273 | 0.014 |
| 711.78488762 | 0.018 |
| 711.94828796 | 0.016 |
| 712.11169374 | 0.018 |
| 712.27510495 | 0.014 |
| 712.4385216 | 0.017 |
| 712.60194369 | 0.013 |
| 712.7653712 | 0.018 |
| 712.92880414 | 0.014 |
| 713.09224251 | 0.017 |
| 713.25568629 | 0.015 |
| 713.41913549 | 0.018 |
| 713.58259011 | 0.013 |
| 713.74605014 | 0.015 |
| 713.90951559 | 0.013 |
| 714.07298643 | 0.016 |
| 714.23646269 | 0.013 |
| 714.39994434 | 0.015 |
| 714.56343139 | 0.013 |
| 714.72692384 | 0.016 |
| 714.89042168 | 0.013 |
| 715.05392491 | 0.015 |
| 715.21743352 | 0.014 |
| 715.38094752 | 0.016 |
| 715.54446691 | 0.018 |
| 715.70799167 | 0.027 |
| 715.8715218 | 0.022 |
| 716.03505731 | 0.028 |
| 716.19859819 | 0.021 |
| 716.36214443 | 0.028 |
| 716.52569604 | 0.019 |
| 716.68925301 | 0.029 |
| 716.85281534 | 0.023 |
| 717.01638302 | 0.031 |
| 717.17995605 | 0.025 |
| 717.34353444 | 0.028 |
| 717.50711817 | 0.024 |
| 717.67070725 | 0.032 |
| 717.83430166 | 0.027 |
| 717.99790142 | 0.032 |
| 718.16150651 | 0.027 |
| 718.32511694 | 0.028 |
| 718.48873269 | 0.027 |
| 718.65235377 | 0.029 |
| 718.81598017 | 0.026 |
| 718.9796119 | 0.028 |
| 719.14324894 | 0.034 |
| 719.3068913 | 0.029 |
| 719.47053897 | 0.029 |
| 719.63419195 | 0.029 |
| 719.79785024 | 0.039 |
| 719.96151383 | 0.029 |
| 720.12518273 | 0.038 |
| 720.28885692 | 0.034 |
| 720.4525364 | 0.038 |
| 720.61622118 | 0.035 |
| 720.77991125 | 0.038 |
| 720.94360661 | 0.037 |
| 721.10730725 | 0.034 |
| 721.27101317 | 0.037 |
| 721.43472437 | 0.038 |
| 721.59844084 | 0.038 |
| 721.76216259 | 0.034 |
| 721.92588961 | 0.034 |
| 722.08962189 | 0.034 |
| 722.25335944 | 0.034 |
| 722.41710225 | 0.033 |
| 722.58085032 | 0.034 |
| 722.74460364 | 0.033 |
| 722.90836221 | 0.035 |
| 723.07212604 | 0.034 |
| 723.23589511 | 0.036 |
| 723.39966943 | 0.034 |
| 723.56344898 | 0.037 |
| 723.72723378 | 0.034 |
| 723.89102381 | 0.039 |
| 724.05481907 | 0.038 |
| 724.21861956 | 0.039 |
| 724.38242528 | 0.037 |
| 724.54623623 | 0.042 |
| 724.71005239 | 0.039 |
| 724.87387377 | 0.042 |
| 725.03770037 | 0.042 |
| 725.20153218 | 0.042 |
| 725.3653692 | 0.04 |
| 725.52921143 | 0.045 |
| 725.69305886 | 0.043 |
| 725.85691149 | 0.046 |
| 726.02076932 | 0.045 |
| 726.18463235 | 0.046 |
| 726.34850057 | 0.05 |
| 726.51237398 | 0.049 |
| 726.67625257 | 0.051 |
| 726.84013635 | 0.051 |
| 727.00402531 | 0.051 |
| 727.16791945 | 0.05 |
| 727.33181876 | 0.049 |
| 727.49572325 | 0.053 |
| 727.65963291 | 0.053 |
| 727.82354773 | 0.053 |
| 727.98746772 | 0.054 |
| 728.15139286 | 0.055 |
| 728.31532317 | 0.053 |
| 728.47925863 | 0.055 |
| 728.64319925 | 0.056 |
| 728.80714501 | 0.059 |
| 728.97109592 | 0.058 |
| 729.13505197 | 0.058 |
| 729.29901317 | 0.059 |
| 729.4629795 | 0.06 |
| 729.62695097 | 0.059 |
| 729.79092758 | 0.062 |
| 729.95490931 | 0.06 |
| 730.11889616 | 0.061 |
| 730.28288815 | 0.061 |
| 730.44688525 | 0.062 |
| 730.61088747 | 0.063 |
| 730.77489481 | 0.062 |
| 730.93890726 | 0.06 |
| 731.10292482 | 0.066 |
| 731.26694748 | 0.064 |
| 731.43097525 | 0.065 |
| 731.59500812 | 0.066 |
| 731.75904609 | 0.067 |
| 731.92308916 | 0.066 |
| 732.08713732 | 0.068 |
| 732.25119056 | 0.068 |
| 732.4152489 | 0.07 |
| 732.57931231 | 0.072 |
| 732.74338081 | 0.07 |
| 732.90745439 | 0.071 |
| 733.07153304 | 0.075 |
| 733.23561677 | 0.074 |
| 733.39970556 | 0.074 |
| 733.56379942 | 0.074 |
| 733.72789835 | 0.077 |
| 733.89200233 | 0.077 |
| 734.05611138 | 0.078 |
| 734.22022548 | 0.077 |
| 734.38434463 | 0.081 |
| 734.54846883 | 0.079 |
| 734.71259808 | 0.082 |
| 734.87673237 | 0.08 |
| 735.04087171 | 0.082 |
| 735.20501608 | 0.081 |
| 735.36916549 | 0.083 |
| 735.53331993 | 0.083 |
| 735.6974794 | 0.082 |
| 735.86164389 | 0.086 |
| 736.02581342 | 0.086 |
| 736.18998796 | 0.087 |
| 736.35416752 | 0.089 |
| 736.51835209 | 0.09 |
| 736.68254168 | 0.089 |
| 736.84673628 | 0.089 |
| 737.01093588 | 0.092 |
| 737.17514049 | 0.093 |
| 737.3393501 | 0.092 |
| 737.50356471 | 0.092 |
| 737.66778431 | 0.095 |
| 737.8320089 | 0.096 |
| 737.99623849 | 0.097 |
| 738.16047306 | 0.099 |
| 738.32471262 | 0.101 |
| 738.48895715 | 0.103 |
| 738.65320667 | 0.102 |
| 738.81746116 | 0.102 |
| 738.98172062 | 0.106 |
| 739.14598505 | 0.107 |
| 739.31025445 | 0.109 |
| 739.47452881 | 0.108 |
| 739.63880814 | 0.112 |
| 739.80309242 | 0.109 |
| 739.96738166 | 0.113 |
| 740.13167585 | 0.113 |
| 740.29597499 | 0.117 |
| 740.46027908 | 0.115 |
| 740.62458811 | 0.119 |
| 740.78890208 | 0.116 |
| 740.95322099 | 0.119 |
| 741.11754483 | 0.12 |
| 741.28187361 | 0.12 |
| 741.44620732 | 0.122 |
| 741.61054595 | 0.125 |
| 741.77488951 | 0.126 |
| 741.93923799 | 0.125 |
| 742.10359139 | 0.128 |
| 742.2679497 | 0.129 |
| 742.43231293 | 0.132 |
| 742.59668106 | 0.131 |
| 742.7610541 | 0.13 |
| 742.92543205 | 0.132 |
| 743.0898149 | 0.133 |
| 743.25420264 | 0.135 |
| 743.41859528 | 0.136 |
| 743.58299281 | 0.141 |
| 743.74739524 | 0.14 |
| 743.91180254 | 0.141 |
| 744.07621474 | 0.141 |
| 744.24063181 | 0.143 |
| 744.40505376 | 0.145 |
| 744.56948059 | 0.146 |
| 744.73391229 | 0.147 |
| 744.89834886 | 0.15 |
| 745.0627903 | 0.156 |
| 745.2272366 | 0.155 |
| 745.39168776 | 0.158 |
| 745.55614378 | 0.154 |
| 745.72060466 | 0.158 |
| 745.88507038 | 0.16 |
| 746.04954096 | 0.162 |
| 746.21401638 | 0.163 |
| 746.37849665 | 0.168 |
| 746.54298176 | 0.169 |
| 746.70747171 | 0.169 |
| 746.87196649 | 0.171 |
| 747.03646611 | 0.17 |
| 747.20097055 | 0.174 |
| 747.36547982 | 0.174 |
| 747.52999392 | 0.175 |
| 747.69451283 | 0.179 |
| 747.85903657 | 0.185 |
| 748.02356512 | 0.186 |
| 748.18809848 | 0.186 |
| 748.35263665 | 0.186 |
| 748.51717963 | 0.191 |
| 748.68172741 | 0.189 |
| 748.84628 | 0.193 |
| 749.01083738 | 0.193 |
| 749.17539956 | 0.192 |
| 749.33996652 | 0.2 |
| 749.50453828 | 0.195 |
| 749.66911483 | 0.202 |
| 749.83369616 | 0.207 |
| 749.99828227 | 0.208 |
| 750.16287316 | 0.21 |
| 750.32746882 | 0.208 |
| 750.49206926 | 0.214 |
| 750.65667447 | 0.216 |
| 750.82128444 | 0.218 |
| 750.98589918 | 0.214 |
| 751.15051868 | 0.223 |
| 751.31514293 | 0.223 |
| 751.47977195 | 0.227 |
| 751.64440571 | 0.225 |
| 751.80904422 | 0.23 |
| 751.97368748 | 0.235 |
| 752.13833549 | 0.236 |
| 752.30298823 | 0.237 |
| 752.46764572 | 0.242 |
| 752.63230794 | 0.245 |
| 752.79697489 | 0.247 |
| 752.96164657 | 0.253 |
| 753.12632298 | 0.247 |
| 753.29100411 | 0.251 |
| 753.45568996 | 0.256 |
| 753.62038053 | 0.261 |
| 753.78507582 | 0.263 |
| 753.94977582 | 0.266 |
| 754.11448053 | 0.261 |
| 754.27918994 | 0.267 |
| 754.44390406 | 0.27 |
| 754.60862288 | 0.273 |
| 754.7733464 | 0.273 |
| 754.93807461 | 0.277 |
| 755.10280752 | 0.277 |
| 755.26754512 | 0.284 |
| 755.4322874 | 0.287 |
| 755.59703436 | 0.287 |
| 755.76178601 | 0.287 |
| 755.92654234 | 0.292 |
| 756.09130334 | 0.294 |
| 756.25606901 | 0.299 |
| 756.42083935 | 0.299 |
| 756.58561436 | 0.304 |
| 756.75039404 | 0.304 |
| 756.91517837 | 0.31 |
| 757.07996736 | 0.317 |
| 757.24476101 | 0.322 |
| 757.40955931 | 0.319 |
| 757.57436226 | 0.319 |
| 757.73916986 | 0.327 |
| 757.9039821 | 0.322 |
| 758.06879898 | 0.339 |
| 758.2336205 | 0.345 |
| 758.39844666 | 0.346 |
| 758.56327744 | 0.347 |
| 758.72811286 | 0.347 |
| 758.89295291 | 0.353 |
| 759.05779757 | 0.355 |
| 759.22264686 | 0.361 |
| 759.38750077 | 0.364 |
| 759.55235929 | 0.371 |
| 759.71722243 | 0.371 |
| 759.88209017 | 0.378 |
| 760.04696252 | 0.381 |
| 760.21183948 | 0.381 |
| 760.37672103 | 0.381 |
| 760.54160719 | 0.39 |
| 760.70649794 | 0.391 |
| 760.87139328 | 0.402 |
| 761.03629321 | 0.404 |
| 761.20119773 | 0.406 |
| 761.36610683 | 0.41 |
| 761.53102051 | 0.409 |
| 761.69593877 | 0.418 |
| 761.86086161 | 0.421 |
| 762.02578902 | 0.429 |
| 762.190721 | 0.433 |
| 762.35565754 | 0.431 |
| 762.52059865 | 0.439 |
| 762.68554432 | 0.442 |
| 762.85049455 | 0.452 |
| 763.01544934 | 0.453 |
| 763.18040867 | 0.459 |
| 763.34537256 | 0.463 |
| 763.51034099 | 0.47 |
| 763.67531397 | 0.472 |
| 763.84029148 | 0.476 |
| 764.00527354 | 0.482 |
| 764.17026013 | 0.484 |
| 764.33525125 | 0.485 |
| 764.5002469 | 0.491 |
| 764.66524708 | 0.502 |
| 764.83025179 | 0.504 |
| 764.99526101 | 0.511 |
| 765.16027475 | 0.517 |
| 765.32529301 | 0.521 |
| 765.49031578 | 0.528 |
| 765.65534306 | 0.533 |
| 765.82037485 | 0.534 |
| 765.98541114 | 0.547 |
| 766.15045193 | 0.546 |
| 766.31549722 | 0.553 |
| 766.480547 | 0.556 |
| 766.64560128 | 0.563 |
| 766.81066005 | 0.567 |
| 766.9757233 | 0.578 |
| 767.14079104 | 0.583 |
| 767.30586326 | 0.59 |
| 767.47093995 | 0.595 |
| 767.63602113 | 0.606 |
| 767.80110677 | 0.608 |
| 767.96619688 | 0.613 |
| 768.13129146 | 0.618 |
| 768.29639051 | 0.624 |
| 768.46149401 | 0.633 |
| 768.62660198 | 0.638 |
| 768.7917144 | 0.64 |
| 768.95683127 | 0.644 |
| 769.12195259 | 0.659 |
| 769.28707835 | 0.665 |
| 769.45220857 | 0.672 |
| 769.61734322 | 0.675 |
| 769.78248231 | 0.68 |
| 769.94762583 | 0.687 |
| 770.11277379 | 0.691 |
| 770.27792618 | 0.705 |
| 770.44308299 | 0.707 |
| 770.60824423 | 0.721 |
| 770.77340989 | 0.727 |
| 770.93857997 | 0.733 |
| 771.10375446 | 0.736 |
| 771.26893337 | 0.741 |
| 771.43411668 | 0.751 |
| 771.5993044 | 0.752 |
| 771.76449653 | 0.764 |
| 771.92969305 | 0.774 |
| 772.09489398 | 0.781 |
| 772.2600993 | 0.784 |
| 772.42530901 | 0.792 |
| 772.59052311 | 0.797 |
| 772.7557416 | 0.807 |
| 772.92096447 | 0.812 |
| 773.08619172 | 0.813 |
| 773.25142335 | 0.816 |
| 773.41665936 | 0.824 |
| 773.58189974 | 0.831 |
| 773.74714449 | 0.839 |
| 773.9123936 | 0.841 |
| 774.07764708 | 0.852 |
| 774.24290492 | 0.857 |
| 774.40816712 | 0.865 |
| 774.57343367 | 0.87 |
| 774.73870458 | 0.878 |
| 774.90397983 | 0.879 |
| 775.06925944 | 0.892 |
| 775.23454338 | 0.894 |
| 775.39983167 | 0.901 |
| 775.56512429 | 0.907 |
| 775.73042125 | 0.917 |
| 775.89572255 | 0.924 |
| 776.06102817 | 0.923 |
| 776.22633812 | 0.937 |
| 776.39165239 | 0.934 |
| 776.55697098 | 0.945 |
| 776.72229389 | 0.939 |
| 776.88762112 | 0.946 |
| 777.05295266 | 0.952 |
| 777.21828851 | 0.954 |
| 777.38362866 | 0.96 |
| 777.54897312 | 0.969 |
| 777.71432188 | 0.967 |
| 777.87967494 | 0.975 |
| 778.0450323 | 0.983 |
| 778.21039394 | 0.973 |
| 778.37575988 | 0.98 |
| 778.5411301 | 0.979 |
| 778.70650461 | 0.982 |
| 778.87188339 | 0.989 |
| 779.03726646 | 0.986 |
| 779.2026538 | 0.992 |
| 779.36804541 | 0.997 |
| 779.53344129 | 0.995 |
| 779.69884144 | 0.994 |
| 779.86424586 | 0.991 |
| 780.02965453 | 0.995 |
| 780.19506746 | 0.993 |
| 780.36048465 | 0.994 |
| 780.52590609 | 0.998 |
| 780.69133178 | 0.999 |
| 780.85676171 | 1 |
| 781.02219589 | 1 |
| 781.18763431 | 0.994 |
| 781.35307697 | 0.991 |
| 781.51852387 | 0.989 |
| 781.68397499 | 0.981 |
| 781.84943035 | 0.981 |
| 782.01488993 | 0.983 |
| 782.18035374 | 0.992 |
| 782.34582176 | 0.981 |
| 782.51129401 | 0.982 |
| 782.67677047 | 0.978 |
| 782.84225114 | 0.975 |
| 783.00773602 | 0.971 |
| 783.17322511 | 0.967 |
| 783.33871841 | 0.967 |
| 783.5042159 | 0.967 |
| 783.66971759 | 0.967 |
| 783.83522348 | 0.967 |
| 784.00073356 | 0.959 |
| 784.16624783 | 0.96 |
| 784.33176629 | 0.942 |
| 784.49728892 | 0.936 |
| 784.66281575 | 0.927 |
| 784.82834674 | 0.926 |
| 784.99388192 | 0.926 |
| 785.15942126 | 0.925 |
| 785.32496478 | 0.915 |
| 785.49051246 | 0.902 |
| 785.65606431 | 0.89 |
| 785.82162032 | 0.888 |
| 785.98718048 | 0.881 |
| 786.1527448 | 0.863 |
| 786.31831328 | 0.86 |
| 786.4838859 | 0.857 |
| 786.64946267 | 0.85 |
| 786.81504358 | 0.849 |
| 786.98062863 | 0.833 |
| 787.14621783 | 0.827 |
| 787.31181115 | 0.821 |
| 787.47740861 | 0.812 |
| 787.6430102 | 0.804 |
| 787.80861592 | 0.804 |
| 787.97422576 | 0.79 |
| 788.13983972 | 0.782 |
| 788.3054578 | 0.782 |
| 788.47107999 | 0.77 |
| 788.6367063 | 0.762 |
| 788.80233671 | 0.755 |
| 788.96797123 | 0.739 |
| 789.13360986 | 0.738 |
| 789.29925259 | 0.727 |
| 789.46489941 | 0.716 |
| 789.63055033 | 0.709 |
| 789.79620534 | 0.706 |
| 789.96186445 | 0.69 |
| 790.12752764 | 0.685 |
| 790.29319491 | 0.673 |
| 790.45886626 | 0.661 |
| 790.62454169 | 0.659 |
| 790.7902212 | 0.644 |
| 790.95590478 | 0.634 |
| 791.12159243 | 0.628 |
| 791.28728414 | 0.615 |
| 791.45297992 | 0.61 |
| 791.61867976 | 0.599 |
| 791.78438366 | 0.587 |
| 791.95009162 | 0.585 |
| 792.11580362 | 0.575 |
| 792.28151968 | 0.567 |
| 792.44723978 | 0.554 |
| 792.61296392 | 0.541 |
| 792.77869211 | 0.533 |
| 792.94442434 | 0.52 |
| 793.1101606 | 0.509 |
| 793.27590089 | 0.503 |
| 793.44164521 | 0.496 |
| 793.60739356 | 0.481 |
| 793.77314593 | 0.48 |
| 793.93890232 | 0.473 |
| 794.10466273 | 0.463 |
| 794.27042716 | 0.453 |
| 794.4361956 | 0.441 |
| 794.60196805 | 0.432 |
| 794.7677445 | 0.421 |
| 794.93352496 | 0.423 |
| 795.09930942 | 0.413 |
| 795.26509788 | 0.405 |
| 795.43089033 | 0.396 |
| 795.59668678 | 0.388 |
| 795.76248721 | 0.381 |
| 795.92829163 | 0.375 |
| 796.09410004 | 0.365 |
| 796.25991242 | 0.357 |
| 796.42572879 | 0.351 |
| 796.59154913 | 0.341 |
| 796.75737344 | 0.336 |
| 796.92320172 | 0.328 |
| 797.08903397 | 0.327 |
| 797.25487018 | 0.319 |
| 797.42071035 | 0.306 |
| 797.58655448 | 0.306 |
| 797.75240257 | 0.298 |
| 797.91825461 | 0.291 |
| 798.08411059 | 0.292 |
| 798.24997053 | 0.279 |
| 798.41583441 | 0.278 |
| 798.58170222 | 0.265 |
| 798.74757398 | 0.263 |
| 798.91344967 | 0.258 |
| 799.0793293 | 0.254 |
| 799.24521285 | 0.247 |
| 799.41110033 | 0.243 |
| 799.57699174 | 0.234 |
| 799.74288706 | 0.228 |
| 799.90878631 | 0.224 |
| 800.07468946 | 0.219 |
| 800.24059653 | 0.216 |
| 800.40650752 | 0.211 |
| 800.5724224 | 0.209 |
| 800.73834119 | 0.207 |
| 800.90426388 | 0.197 |
| 801.07019047 | 0.192 |
| 801.23612096 | 0.19 |
| 801.40205534 | 0.188 |
| 801.5679936 | 0.182 |
| 801.73393576 | 0.183 |
| 801.89988179 | 0.176 |
| 802.06583171 | 0.169 |
| 802.23178551 | 0.166 |
| 802.39774318 | 0.162 |
| 802.56370472 | 0.159 |
| 802.72967013 | 0.153 |
| 802.89563941 | 0.152 |
| 803.06161256 | 0.152 |
| 803.22758956 | 0.147 |
| 803.39357042 | 0.146 |
| 803.55955514 | 0.139 |
| 803.72554371 | 0.138 |
| 803.89153613 | 0.135 |
| 804.0575324 | 0.132 |
| 804.22353251 | 0.132 |
| 804.38953646 | 0.13 |
| 804.55554424 | 0.127 |
| 804.72155587 | 0.122 |
| 804.88757132 | 0.12 |
| 805.05359061 | 0.12 |
| 805.21961372 | 0.113 |
| 805.38564066 | 0.112 |
| 805.55167141 | 0.108 |
| 805.71770599 | 0.109 |
| 805.88374438 | 0.108 |
| 806.04978658 | 0.106 |
| 806.21583259 | 0.102 |
| 806.38188241 | 0.101 |
| 806.54793603 | 0.098 |
| 806.71399346 | 0.096 |
| 806.88005468 | 0.094 |
| 807.04611969 | 0.093 |
| 807.2121885 | 0.089 |
| 807.3782611 | 0.087 |
| 807.54433749 | 0.087 |
| 807.71041765 | 0.086 |
| 807.8765016 | 0.082 |
| 808.04258933 | 0.08 |
| 808.20868083 | 0.079 |
| 808.37477611 | 0.081 |
| 808.54087515 | 0.074 |
| 808.70697796 | 0.074 |
| 808.87308454 | 0.072 |
| 809.03919487 | 0.073 |
| 809.20530897 | 0.07 |
| 809.37142682 | 0.07 |
| 809.53754842 | 0.067 |
| 809.70367377 | 0.067 |
| 809.86980286 | 0.064 |
| 810.0359357 | 0.064 |
| 810.20207229 | 0.063 |
| 810.36821261 | 0.063 |
| 810.53435666 | 0.062 |
| 810.70050445 | 0.058 |
| 810.86665596 | 0.059 |
| 811.03281121 | 0.056 |
| 811.19897017 | 0.054 |
| 811.36513286 | 0.054 |
| 811.53129927 | 0.052 |
| 811.69746939 | 0.052 |
| 811.86364322 | 0.052 |
| 812.02982076 | 0.05 |
| 812.19600201 | 0.05 |
| 812.36218697 | 0.049 |
| 812.52837562 | 0.049 |
| 812.69456797 | 0.044 |
| 812.86076402 | 0.045 |
| 813.02696376 | 0.04 |
| 813.19316719 | 0.038 |
| 813.3593743 | 0.041 |
| 813.5255851 | 0.035 |
| 813.69179958 | 0.038 |
| 813.85801774 | 0.037 |
| 814.02423957 | 0.035 |
| 814.19046508 | 0.034 |
| 814.35669425 | 0.034 |
| 814.5229271 | 0.033 |
| 814.6891636 | 0.034 |
| 814.85540377 | 0.035 |
| 815.02164759 | 0.037 |
| 815.18789507 | 0.036 |
| 815.3541462 | 0.038 |
| 815.52040098 | 0.039 |
| 815.68665941 | 0.03 |
| 815.85292148 | 0.038 |
| 816.01918719 | 0.028 |
| 816.18545654 | 0.036 |
| 816.35172953 | 0.028 |
| 816.51800615 | 0.026 |
| 816.68428639 | 0.028 |
| 816.85057027 | 0.025 |
| 817.01685777 | 0.029 |
| 817.18314888 | 0.027 |
| 817.34944362 | 0.031 |
| 817.51574197 | 0.026 |
| 817.68204393 | 0.031 |
| 817.84834951 | 0.021 |
| 818.01465869 | 0.03 |
| 818.18097147 | 0.02 |
| 818.34728785 | 0.021 |
| 818.51360784 | 0.019 |
| 818.67993141 | 0.019 |
| 818.84625858 | 0.015 |
| 819.01258934 | 0.018 |
| 819.17892369 | 0.013 |
| 819.34526162 | 0.014 |
| 819.51160313 | 0.013 |
| 819.67794822 | 0.016 |
| 819.84429688 | 0.016 |
| 820.01064912 | 0.018 |
| 820.17700492 | 0.015 |
| 820.34336429 | 0.017 |
| 820.50972723 | 0.015 |
| 820.67609372 | 0.018 |
| 820.84246378 | 0.017 |
| 821.00883739 | 0.015 |
| 821.17521455 | 0.018 |
| 821.34159526 | 0.016 |
| 821.50797952 | 0.018 |
| 821.67436732 | 0.017 |
| 821.84075866 | 0.017 |
| 822.00715354 | 0.015 |
| 822.17355196 | 0.016 |
| 822.3399539 | 0.014 |
| 822.50635938 | 0.016 |
| 822.67276838 | 0.014 |
| 822.83918091 | 0.016 |
| 823.00559696 | 0.016 |
| 823.17201653 | 0.014 |
| 823.33843961 | 0.016 |
| 823.5048662 | 0.014 |
| 823.6712963 | 0.016 |
| 823.83772991 | 0.014 |
| 824.00416703 | 0.016 |
| 824.17060764 | 0.015 |
| 824.33705175 | 0.016 |
| 824.50349936 | 0.014 |
| 824.66995046 | 0.016 |
| 824.83640505 | 0.014 |
| 825.00286312 | 0.016 |
| 825.16932468 | 0.014 |
| 825.33578972 | 0.016 |
| 825.50225824 | 0.015 |
| 825.66873023 | 0.016 |
| 825.8352057 | 0.015 |
| 826.00168463 | 0.016 |
| 826.16816703 | 0.015 |
| 826.3346529 | 0.016 |
| 826.50114222 | 0.015 |
| 826.66763501 | 0.016 |
| 826.83413125 | 0.015 |
| 827.00063094 | 0.016 |
| 827.16713408 | 0.015 |
| 827.33364067 | 0.015 |
| 827.5001507 | 0.015 |
| 827.66666417 | 0.016 |
| 827.83318108 | 0.015 |
| 827.99970142 | 0.015 |
| 828.1662252 | 0.014 |
| 828.33275241 | 0.015 |
| 828.49928304 | 0.013 |
| 828.6658171 | 0.015 |
| 828.83235457 | 0.014 |
| 828.99889547 | 0.015 |
| 829.16543978 | 0.012 |
| 829.3319875 | 0.014 |
| 829.49853863 | 0.015 |
| 829.66509317 | 0.013 |
| 829.83165111 | 0.012 |
| 829.99821246 | 0.012 |
| 830.1647772 | 0.013 |
| 830.33134534 | 0.012 |
| 830.49791686 | 0.01 |
| 830.66449178 | 0.013 |
| 830.83107009 | 0.014 |
| 830.99765177 | 0.009 |
| 831.16423684 | 0.011 |
| 831.33082529 | 0.008 |
| 831.49741711 | 0.009 |
| 831.66401231 | 0.011 |
| 831.83061087 | 0.01 |
| 831.9972128 | 0.011 |
| 832.16381809 | 0.01 |
| 832.33042675 | 0.008 |
| 832.49703876 | 0.01 |
| 832.66365413 | 0.008 |
| 832.83027285 | 0.008 |
| 832.99689492 | 0.01 |
| 833.16352034 | 0.012 |
| 833.3301491 | 0.009 |
| 833.4967812 | 0.009 |
| 833.66341663 | 0.008 |
| 833.83005541 | 0.01 |
| 833.99669751 | 0.007 |
| 834.16334295 | 0.008 |
| 834.32999171 | 0.008 |
| 834.4966438 | 0.007 |
| 834.6632992 | 0.005 |
| 834.82995793 | 0.007 |
| 834.99661997 | 0.007 |
| 835.16328532 | 0.009 |
| 835.32995398 | 0.007 |
| 835.49662594 | 0.006 |
| 835.66330122 | 0.006 |
| 835.82997979 | 0.007 |
| 835.99666166 | 0.008 |
| 836.16334682 | 0.008 |
| 836.33003528 | 0.008 |
| 836.49672703 | 0.006 |
| 836.66342206 | 0.007 |
| 836.83012038 | 0.007 |
| 836.99682197 | 0.007 |
| 837.16352685 | 0.007 |
| 837.330235 | 0.007 |
| 837.49694642 | 0.006 |
| 837.66366111 | 0.006 |
| 837.83037907 | 0.005 |
| 837.9971003 | 0.007 |
| 838.16382478 | 0.005 |
| 838.33055252 | 0.005 |
| 838.49728352 | 0.008 |
| 838.66401776 | 0.005 |
| 838.83075526 | 0.006 |
| 838.99749601 | 0.004 |
| 839.16424 | 0.006 |
| 839.33098722 | 0.005 |
| 839.49773769 | 0.005 |
| 839.66449139 | 0.005 |
| 839.83124833 | 0.007 |
| 839.99800849 | 0.005 |
| 840.16477188 | 0.004 |
| 840.33153849 | 0.005 |
| 840.49830833 | 0.005 |
| 840.66508138 | 0.005 |
| 840.83185765 | 0.006 |
| 840.99863713 | 0.006 |
| 841.16541982 | 0.006 |
| 841.33220571 | 0.005 |
| 841.49899481 | 0.005 |
| 841.66578711 | 0.005 |
| 841.83258261 | 0.005 |
| 841.9993813 | 0.005 |
| 842.16618319 | 0.005 |
| 842.33298826 | 0.005 |
| 842.49979652 | 0.005 |
| 842.66660797 | 0.005 |
| 842.83342259 | 0.006 |
| 843.0002404 | 0.006 |
| 843.16706138 | 0.005 |
| 843.33388553 | 0.004 |
| 843.50071285 | 0.005 |
| 843.66754333 | 0.006 |
| 843.83437698 | 0.006 |
| 844.00121379 | 0.004 |
| 844.16805376 | 0.007 |
| 844.33489689 | 0.005 |
| 844.50174316 | 0.005 |
| 844.66859259 | 0.004 |
| 844.83544516 | 0.006 |
| 845.00230088 | 0.004 |
| 845.16915973 | 0.003 |
| 845.33602173 | 0.004 |
| 845.50288686 | 0.007 |
| 845.66975512 | 0.004 |
| 845.83662651 | 0.005 |
| 846.00350103 | 0.005 |
| 846.17037867 | 0.005 |
| 846.33725943 | 0.004 |
| 846.50414331 | 0.005 |
| 846.67103031 | 0.005 |
| 846.83792041 | 0.004 |
| 847.00481363 | 0.004 |
| 847.17170995 | 0.004 |
| 847.33860938 | 0.004 |
| 847.50551191 | 0.005 |
| 847.67241753 | 0.005 |
| 847.83932625 | 0.004 |
| 848.00623807 | 0.004 |
| 848.17315297 | 0.004 |
| 848.34007096 | 0.006 |
| 848.50699203 | 0.005 |
| 848.67391618 | 0.006 |
| 848.84084341 | 0.004 |
| 849.00777372 | 0.006 |
| 849.1747071 | 0.003 |
| 849.34164354 | 0.005 |
| 849.50858306 | 0.006 |
| 849.67552564 | 0.004 |
| 849.84247127 | 0.005 |
| 850.00941997 | 0.003 |
| 850.17637172 | 0.005 |
| 850.34332653 | 0.004 |
| 850.51028438 | 0.006 |
| 850.67724528 | 0.004 |
| 850.84420922 | 0.006 |
| 851.0111762 | 0.003 |
| 851.17814623 | 0.005 |
| 851.34511928 | 0.005 |
| 851.51209537 | 0.004 |
| 851.67907449 | 0.003 |
| 851.84605664 | 0.002 |
| 852.0130418 | 0.004 |
| 852.18002999 | 0.004 |
| 852.3470212 | 0.004 |
| 852.51401542 | 0.005 |
| 852.68101266 | 0.004 |
| 852.8480129 | 0.005 |
| 853.01501615 | 0.004 |
| 853.1820224 | 0.003 |
| 853.34903166 | 0.004 |
| 853.51604391 | 0.004 |
| 853.68305916 | 0.004 |
| 853.8500774 | 0.005 |
| 854.01709863 | 0.005 |
| 854.18412284 | 0.005 |
| 854.35115004 | 0.004 |
| 854.51818022 | 0.005 |
| 854.68521338 | 0.004 |
| 854.85224951 | 0.006 |
| 855.01928862 | 0.004 |
| 855.18633069 | 0.005 |
| 855.35337573 | 0.004 |
| 855.52042374 | 0.005 |
| 855.6874747 | 0.003 |
| 855.85452862 | 0.005 |
| 856.0215855 | 0.004 |
| 856.18864533 | 0.005 |
| 856.35570811 | 0.004 |
| 856.52277384 | 0.005 |
| 856.68984251 | 0.005 |
| 856.85691412 | 0.005 |
| 857.02398867 | 0.005 |
| 857.19106615 | 0.006 |
| 857.35814657 | 0.006 |
| 857.52522991 | 0.006 |
| 857.69231618 | 0.004 |
| 857.85940538 | 0.005 |
| 858.02649749 | 0.004 |
| 858.19359253 | 0.005 |
| 858.36069048 | 0.004 |
| 858.52779134 | 0.005 |
| 858.69489511 | 0.003 |
| 858.86200178 | 0.002 |
| 859.02911136 | 0.003 |
| 859.19622384 | 0.005 |
| 859.36333922 | 0.004 |
| 859.5304575 | 0.004 |
| 859.69757866 | 0.003 |
| 859.86470272 | 0.006 |
| 860.03182966 | 0.004 |
| 860.19895949 | 0.005 |
| 860.36609219 | 0.003 |
| 860.53322778 | 0.002 |
| 860.70036623 | 0.004 |
| 860.86750757 | 0.005 |
| 861.03465177 | 0.004 |
| 861.20179883 | 0.006 |
| 861.36894876 | 0.006 |
| 861.53610156 | 0.004 |
| 861.7032572 | 0.005 |
| 861.87041571 | 0.005 |
| 862.03757707 | 0.003 |
| 862.20474127 | 0.006 |
| 862.37190832 | 0.005 |
| 862.53907822 | 0.005 |
| 862.70625096 | 0.004 |
| 862.87342653 | 0.005 |
| 863.04060494 | 0.005 |
| 863.20778618 | 0.004 |
| 863.37497025 | 0.004 |
| 863.54215715 | 0.005 |
| 863.70934687 | 0.003 |
| 863.87653941 | 0.005 |
| 864.04373477 | 0.005 |
| 864.21093295 | 0.005 |
| 864.37813393 | 0.004 |
| 864.54533773 | 0.005 |
| 864.71254433 | 0.004 |
| 864.87975374 | 0.005 |
| 865.04696594 | 0.005 |
| 865.21418095 | 0.003 |
| 865.38139875 | 0.004 |
| 865.54861934 | 0.004 |
| 865.71584272 | 0.005 |
| 865.88306889 | 0.003 |
| 866.05029784 | 0.004 |
| 866.21752957 | 0.003 |
| 866.38476408 | 0.005 |
| 866.55200137 | 0.004 |
| 866.71924142 | 0.004 |
| 866.88648425 | 0.004 |
| 867.05372984 | 0.005 |
| 867.2209782 | 0.005 |
| 867.38822932 | 0.005 |
| 867.55548319 | 0.005 |
| 867.72273982 | 0.003 |
| 867.8899992 | 0.003 |
| 868.05726134 | 0.006 |
| 868.22452621 | 0.004 |
| 868.39179383 | 0.004 |
| 868.5590642 | 0.003 |
| 868.7263373 | 0.006 |
| 868.89361313 | 0.004 |
| 869.0608917 | 0.004 |
| 869.22817299 | 0.004 |
| 869.39545702 | 0.004 |
| 869.56274376 | 0.004 |
| 869.73003323 | 0.005 |
| 869.89732542 | 0.003 |
| 870.06462032 | 0.004 |
| 870.23191793 | 0.003 |
| 870.39921825 | 0.004 |
| 870.56652128 | 0.003 |
| 870.73382701 | 0.005 |
| 870.90113544 | 0.003 |
| 871.06844657 | 0.005 |
| 871.2357604 | 0.005 |
| 871.40307691 | 0.005 |
| 871.57039612 | 0.004 |
| 871.73771801 | 0.004 |
| 871.90504259 | 0.004 |
| 872.07236985 | 0.005 |
| 872.23969978 | 0.004 |
| 872.40703239 | 0.006 |
| 872.57436767 | 0.003 |
| 872.74170563 | 0.005 |
| 872.90904624 | 0.003 |
| 873.07638952 | 0.005 |
| 873.24373547 | 0.003 |
| 873.41108407 | 0.004 |
| 873.57843532 | 0.003 |
| 873.74578923 | 0.004 |
| 873.91314579 | 0.004 |
| 874.08050499 | 0.006 |
| 874.24786683 | 0.003 |
| 874.41523132 | 0.005 |
| 874.58259845 | 0.003 |
| 874.74996821 | 0.005 |
| 874.9173406 | 0.004 |
| 875.08471562 | 0.004 |
| 875.25209327 | 0.004 |
| 875.41947354 | 0.005 |
| 875.58685643 | 0.003 |
| 875.75424194 | 0.005 |
| 875.92163007 | 0.004 |
| 876.0890208 | 0.004 |
| 876.25641415 | 0.003 |
| 876.4238101 | 0.006 |
| 876.59120866 | 0.003 |
| 876.75860981 | 0.005 |
| 876.92601357 | 0.004 |
| 877.09341992 | 0.005 |
| 877.26082886 | 0.004 |
| 877.42824039 | 0.006 |
| 877.59565451 | 0.003 |
| 877.76307121 | 0.004 |
| 877.93049049 | 0.004 |
| 878.09791235 | 0.004 |
| 878.26533679 | 0.007 |
| 878.43276379 | 0.003 |
| 878.60019337 | 0.003 |
| 878.76762551 | 0.004 |
| 878.93506022 | 0.004 |
| 879.10249748 | 0.004 |
| 879.26993731 | 0.003 |
| 879.43737969 | 0.005 |
| 879.60482462 | 0.002 |
| 879.7722721 | 0.004 |
| 879.93972213 | 0.004 |
| 880.1071747 | 0.005 |
| 880.27462981 | 0.003 |
| 880.44208746 | 0.005 |
| 880.60954764 | 0.003 |
| 880.77701036 | 0.007 |
| 880.94447561 | 0.004 |
| 881.11194338 | 0.005 |
| 881.27941367 | 0.003 |
| 881.44688649 | 0.005 |
| 881.61436183 | 0.005 |
| 881.78183967 | 0.004 |
| 881.94932004 | 0.003 |
| 882.11680291 | 0.006 |
| 882.28428828 | 0.003 |
| 882.45177616 | 0.005 |
| 882.61926654 | 0.003 |
| 882.78675942 | 0.004 |
| 882.9542548 | 0.005 |
| 883.12175266 | 0.005 |
| 883.28925302 | 0.003 |
| 883.45675586 | 0.006 |
| 883.62426119 | 0.005 |
| 883.79176899 | 0.005 |
| 883.95927928 | 0.004 |
| 884.12679203 | 0.005 |
| 884.29430726 | 0.004 |
| 884.46182496 | 0.004 |
| 884.62934513 | 0.004 |
| 884.79686776 | 0.005 |
| 884.96439285 | 0.007 |
| 885.1319204 | 0.006 |
| 885.2994504 | 0.003 |
| 885.46698286 | 0.005 |
| 885.63451776 | 0.004 |
| 885.80205512 | 0.005 |
| 885.96959491 | 0.002 |
| 886.13713715 | 0.005 |
| 886.30468182 | 0.006 |
| 886.47222893 | 0.006 |
| 886.63977847 | 0.003 |
| 886.80733044 | 0.005 |
| 886.97488483 | 0.003 |
| 887.14244165 | 0.006 |
| 887.31000089 | 0.004 |
| 887.47756255 | 0.005 |
| 887.64512662 | 0.005 |
| 887.81269311 | 0.006 |
| 887.980262 | 0.003 |
| 888.1478333 | 0.006 |
| 888.31540701 | 0.004 |
| 888.48298311 | 0.005 |
| 888.65056161 | 0.003 |
| 888.81814251 | 0.004 |
| 888.9857258 | 0.003 |
| 889.15331148 | 0.006 |
| 889.32089955 | 0.003 |
| 889.48848999 | 0.007 |
| 889.65608282 | 0.003 |
| 889.82367803 | 0.004 |
| 889.99127561 | 0.004 |
| 890.15887557 | 0.005 |
| 890.32647789 | 0.004 |
| 890.49408258 | 0.006 |
| 890.66168964 | 0.004 |
| 890.82929905 | 0.004 |
| 890.99691082 | 0.003 |
| 891.16452495 | 0.005 |
| 891.33214143 | 0.006 |
| 891.49976026 | 0.004 |
| 891.66738143 | 0.004 |
| 891.83500495 | 0.006 |
| 892.00263081 | 0.005 |
| 892.170259 | 0.005 |
| 892.33788953 | 0.003 |
| 892.5055224 | 0.003 |
| 892.67315759 | 0.005 |
| 892.84079511 | 0.005 |
| 893.00843495 | 0.004 |
| 893.17607712 | 0.005 |
| 893.3437216 | 0.003 |
| 893.51136839 | 0.005 |
| 893.6790175 | 0.004 |
| 893.84666892 | 0.006 |
| 894.01432264 | 0.004 |
| 894.18197867 | 0.006 |
| 894.349637 | 0.004 |
| 894.51729762 | 0.005 |
| 894.68496054 | 0.005 |
| 894.85262576 | 0.006 |
| 895.02029326 | 0.005 |
| 895.18796305 | 0.005 |
| 895.35563512 | 0.003 |
| 895.52330947 | 0.005 |
| 895.6909861 | 0.003 |
| 895.85866501 | 0.005 |
| 896.02634618 | 0.004 |
| 896.19402963 | 0.008 |
| 896.36171534 | 0.004 |
| 896.52940332 | 0.005 |
| 896.69709356 | 0.005 |
| 896.86478605 | 0.005 |
| 897.0324808 | 0.005 |
| 897.2001778 | 0.006 |
| 897.36787705 | 0.003 |
| 897.53557855 | 0.005 |
| 897.70328229 | 0.004 |
| 897.87098827 | 0.005 |
| 898.03869649 | 0.004 |
| 898.20640695 | 0.006 |
| 898.37411963 | 0.003 |
| 898.54183455 | 0.006 |
| 898.70955169 | 0.004 |
| 898.87727106 | 0.006 |
| 899.04499264 | 0.004 |
| 899.21271645 | 0.005 |
| 899.38044246 | 0.003 |
| 899.5481707 | 0.006 |
| 899.71590114 | 0.004 |
| 899.88363378 | 0.003 |
| 900.05136863 | 0.005 |
| 900.21910568 | 0.004 |
| 900.38684493 | 0.005 |
| 900.55458637 | 0.006 |
| 900.72233001 | 0.004 |
| 900.89007583 | 0.007 |
| 901.05782384 | 0.003 |
| 901.22557404 | 0.004 |
| 901.39332641 | 0.003 |
| 901.56108097 | 0.005 |
| 901.72883769 | 0.004 |
| 901.89659659 | 0.003 |
| 902.06435766 | 0.004 |
| 902.2321209 | 0.006 |
| 902.3998863 | 0.004 |
| 902.56765385 | 0.004 |
| 902.73542357 | 0.004 |
| 902.90319544 | 0.005 |
| 903.07096947 | 0.005 |
| 903.23874564 | 0.005 |
| 903.40652396 | 0.004 |
| 903.57430442 | 0.004 |
| 903.74208703 | 0.004 |
| 903.90987177 | 0.006 |
| 904.07765865 | 0.006 |
| 904.24544765 | 0.004 |
| 904.41323879 | 0.004 |
| 904.58103206 | 0.005 |
| 904.74882744 | 0.003 |
| 904.91662495 | 0.005 |
| 905.08442458 | 0.005 |
| 905.25222632 | 0.005 |
| 905.42003017 | 0.003 |
| 905.58783613 | 0.005 |
| 905.7556442 | 0.004 |
| 905.92345437 | 0.006 |
| 906.09126665 | 0.005 |
| 906.25908102 | 0.005 |
| 906.42689748 | 0.005 |
| 906.59471604 | 0.005 |
| 906.76253668 | 0.003 |
| 906.93035942 | 0.004 |
| 907.09818423 | 0.004 |
| 907.26601113 | 0.006 |
| 907.4338401 | 0.005 |
| 907.60167115 | 0.006 |
| 907.76950428 | 0.002 |
| 907.93733947 | 0.005 |
| 908.10517672 | 0.004 |
| 908.27301604 | 0.006 |
| 908.44085742 | 0.005 |
| 908.60870086 | 0.005 |
| 908.77654636 | 0.005 |
| 908.9443939 | 0.004 |
| 909.1122435 | 0.005 |
| 909.28009514 | 0.005 |
| 909.44794882 | 0.005 |
| 909.61580455 | 0.004 |
| 909.78366231 | 0.005 |
| 909.95152211 | 0.006 |
| 910.11938394 | 0.004 |
| 910.2872478 | 0.004 |
| 910.45511369 | 0.006 |
| 910.62298159 | 0.005 |
| 910.79085152 | 0.003 |
| 910.95872347 | 0.004 |
| 911.12659743 | 0.006 |
| 911.29447341 | 0.003 |
| 911.46235139 | 0.004 |
| 911.63023138 | 0.003 |
| 911.79811337 | 0.005 |
| 911.96599737 | 0.004 |
| 912.13388336 | 0.007 |
| 912.30177135 | 0.005 |
| 912.46966133 | 0.007 |
| 912.63755329 | 0.005 |
| 912.80544725 | 0.006 |
| 912.97334318 | 0.005 |
| 913.1412411 | 0.005 |
| 913.309141 | 0.006 |
| 913.47704287 | 0.004 |
| 913.64494671 | 0.004 |
| 913.81285252 | 0.004 |
| 913.9807603 | 0.003 |
| 914.14867004 | 0.004 |
| 914.31658175 | 0.005 |
| 914.48449541 | 0.004 |
| 914.65241102 | 0.005 |
| 914.82032859 | 0.003 |
| 914.9882481 | 0.004 |
| 915.15616957 | 0.005 |
| 915.32409297 | 0.004 |
| 915.49201832 | 0.01 |
| 915.6599456 | 0.004 |
| 915.82787482 | 0.005 |
| 915.99580597 | 0.004 |
| 916.16373905 | 0.006 |
| 916.33167406 | 0.004 |
| 916.49961099 | 0.005 |
| 916.66754984 | 0.004 |
| 916.83549061 | 0.005 |
| 917.00343329 | 0.004 |
| 917.17137789 | 0.006 |
| 917.33932439 | 0.004 |
| 917.5072728 | 0.003 |
| 917.67522312 | 0.006 |
| 917.84317533 | 0.005 |
| 918.01112944 | 0.004 |
| 918.17908545 | 0.007 |
| 918.34704335 | 0.005 |
| 918.51500314 | 0.004 |
| 918.68296481 | 0.004 |
| 918.85092837 | 0.005 |
| 919.01889381 | 0.005 |
| 919.18686113 | 0.005 |
| 919.35483032 | 0.004 |
| 919.52280138 | 0.006 |
| 919.69077432 | 0.004 |
| 919.85874911 | 0.005 |
| 920.02672578 | 0.006 |
| 920.1947043 | 0.005 |
| 920.36268468 | 0.004 |
| 920.53066692 | 0.005 |
| 920.698651 | 0.006 |
| 920.86663694 | 0.004 |
| 921.03462472 | 0.005 |
| 921.20261435 | 0.005 |
| 921.37060582 | 0.005 |
| 921.53859912 | 0.003 |
| 921.70659426 | 0.004 |
| 921.87459123 | 0.005 |
| 922.04259003 | 0.005 |
| 922.21059066 | 0.007 |
| 922.37859311 | 0.004 |
| 922.54659738 | 0.005 |
| 922.71460347 | 0.005 |
| 922.88261138 | 0.006 |
| 923.05062109 | 0.005 |
| 923.21863262 | 0.004 |
| 923.38664595 | 0.004 |
| 923.55466108 | 0.007 |
| 923.72267802 | 0.004 |
| 923.89069675 | 0.005 |
| 924.05871728 | 0.003 |
| 924.2267396 | 0.004 |
| 924.39476371 | 0.004 |
| 924.5627896 | 0.006 |
| 924.73081728 | 0.004 |
| 924.89884674 | 0.005 |
| 925.06687797 | 0.004 |
| 925.23491099 | 0.004 |
| 925.40294577 | 0.005 |
| 925.57098232 | 0.006 |
| 925.73902064 | 0.004 |
| 925.90706072 | 0.005 |
| 926.07510257 | 0.005 |
| 926.24314617 | 0.005 |
| 926.41119152 | 0.005 |
| 926.57923863 | 0.006 |
| 926.74728749 | 0.005 |
| 926.91533809 | 0.004 |
| 927.08339044 | 0.005 |
| 927.25144452 | 0.005 |
| 927.41950035 | 0.005 |
| 927.58755791 | 0.005 |
| 927.7556172 | 0.005 |
| 927.92367822 | 0.005 |
| 928.09174097 | 0.005 |
| 928.25980544 | 0.005 |
| 928.42787163 | 0.004 |
| 928.59593954 | 0.004 |
| 928.76400916 | 0.004 |
| 928.9320805 | 0.004 |
| 929.10015354 | 0.006 |
| 929.26822829 | 0.006 |
| 929.43630475 | 0.005 |
| 929.6043829 | 0.004 |
| 929.77246275 | 0.007 |
| 929.9405443 | 0.006 |
| 930.10862754 | 0.005 |
| 930.27671247 | 0.005 |
| 930.44479908 | 0.007 |
| 930.61288738 | 0.005 |
| 930.78097736 | 0.004 |
| 930.94906902 | 0.005 |
| 931.11716235 | 0.005 |
| 931.28525735 | 0.005 |
| 931.45335402 | 0.004 |
| 931.62145236 | 0.004 |
| 931.78955237 | 0.006 |
| 931.95765403 | 0.007 |
| 932.12575735 | 0.004 |
| 932.29386232 | 0.004 |
| 932.46196895 | 0.005 |
| 932.63007723 | 0.006 |
| 932.79818715 | 0.004 |
| 932.96629872 | 0.005 |
| 933.13441192 | 0.005 |
| 933.30252677 | 0.004 |
| 933.47064325 | 0.005 |
| 933.63876136 | 0.004 |
| 933.8068811 | 0.005 |
| 933.97500246 | 0.008 |
| 934.14312545 | 0.006 |
| 934.31125006 | 0.007 |
| 934.47937629 | 0.006 |
| 934.64750413 | 0.005 |
| 934.81563359 | 0.005 |
| 934.98376465 | 0.004 |
| 935.15189732 | 0.006 |
| 935.3200316 | 0.005 |
| 935.48816747 | 0.005 |
| 935.65630494 | 0.006 |
| 935.82444401 | 0.004 |
| 935.99258467 | 0.004 |
| 936.16072691 | 0.004 |
| 936.32887075 | 0.006 |
| 936.49701617 | 0.003 |
| 936.66516316 | 0.005 |
| 936.83331174 | 0.005 |
| 937.00146189 | 0.003 |
| 937.16961361 | 0.004 |
| 937.3377669 | 0.006 |
| 937.50592176 | 0.004 |
| 937.67407818 | 0.005 |
| 937.84223616 | 0.004 |
| 938.0103957 | 0.004 |
| 938.1785568 | 0.005 |
| 938.34671944 | 0.005 |
| 938.51488364 | 0.005 |
| 938.68304938 | 0.006 |
| 938.85121666 | 0.004 |
| 939.01938549 | 0.007 |
| 939.18755585 | 0.004 |
| 939.35572775 | 0.005 |
| 939.52390118 | 0.004 |
| 939.69207614 | 0.005 |
| 939.86025262 | 0.006 |
| 940.02843063 | 0.006 |
| 940.19661016 | 0.005 |
| 940.36479121 | 0.005 |
| 940.53297377 | 0.006 |
| 940.70115784 | 0.004 |
| 940.86934343 | 0.006 |
| 941.03753051 | 0.007 |
| 941.20571911 | 0.006 |
| 941.3739092 | 0.006 |
| 941.54210079 | 0.005 |
| 941.71029388 | 0.005 |
| 941.87848845 | 0.006 |
| 942.04668452 | 0.005 |
| 942.21488207 | 0.004 |
| 942.38308111 | 0.005 |
| 942.55128162 | 0.006 |
| 942.71948362 | 0.005 |
| 942.88768709 | 0.005 |
| 943.05589203 | 0.006 |
| 943.22409844 | 0.004 |
| 943.39230631 | 0.007 |
| 943.56051565 | 0.007 |
| 943.72872645 | 0.004 |
| 943.89693871 | 0.004 |
| 944.06515242 | 0.006 |
| 944.23336759 | 0.006 |
| 944.4015842 | 0.003 |
| 944.56980226 | 0.005 |
| 944.73802176 | 0.006 |
| 944.90624271 | 0.004 |
| 945.07446509 | 0.005 |
| 945.24268891 | 0.006 |
| 945.41091415 | 0.005 |
| 945.57914083 | 0.006 |
| 945.74736893 | 0.005 |
| 945.91559846 | 0.004 |
| 946.08382941 | 0.005 |
| 946.25206177 | 0.004 |
| 946.42029555 | 0.005 |
| 946.58853074 | 0.005 |
| 946.75676735 | 0.005 |
| 946.92500535 | 0.005 |
| 947.09324476 | 0.005 |
| 947.26148557 | 0.005 |
| 947.42972778 | 0.005 |
| 947.59797138 | 0.006 |
| 947.76621638 | 0.007 |
| 947.93446276 | 0.006 |
| 948.10271054 | 0.007 |
| 948.27095969 | 0.006 |
| 948.43921022 | 0.005 |
| 948.60746214 | 0.005 |
| 948.77571542 | 0.006 |
| 948.94397008 | 0.005 |
| 949.11222611 | 0.005 |
| 949.2804835 | 0.006 |
| 949.44874226 | 0.005 |
| 949.61700238 | 0.005 |
| 949.78526385 | 0.005 |
| 949.95352668 | 0.003 |
| 950.12179087 | 0.005 |
| 950.2900564 | 0.004 |
| 950.45832328 | 0.005 |
| 950.6265915 | 0.006 |
| 950.79486106 | 0.005 |
| 950.96313196 | 0.005 |
| 951.13140419 | 0.005 |
| 951.29967776 | 0.006 |
| 951.46795265 | 0.005 |
| 951.63622887 | 0.006 |
| 951.80450642 | 0.004 |
| 951.97278528 | 0.006 |
| 952.14106546 | 0.004 |
| 952.30934696 | 0.004 |
| 952.47762977 | 0.005 |
| 952.64591389 | 0.006 |
| 952.81419931 | 0.005 |
| 952.98248604 | 0.006 |
| 953.15077407 | 0.004 |
| 953.3190634 | 0.005 |
| 953.48735402 | 0.003 |
| 953.65564593 | 0.005 |
| 953.82393913 | 0.006 |
| 953.99223362 | 0.005 |
| 954.16052939 | 0.005 |
| 954.32882644 | 0.005 |
| 954.49712477 | 0.004 |
| 954.66542438 | 0.007 |
| 954.83372525 | 0.004 |
| 955.0020274 | 0.006 |
| 955.17033081 | 0.005 |
| 955.33863548 | 0.006 |
| 955.50694142 | 0.004 |
| 955.67524861 | 0.005 |
| 955.84355706 | 0.004 |
| 956.01186676 | 0.006 |
| 956.18017771 | 0.004 |
| 956.3484899 | 0.006 |
| 956.51680334 | 0.005 |
| 956.68511802 | 0.005 |
| 956.85343394 | 0.005 |
| 957.02175109 | 0.004 |
| 957.19006947 | 0.007 |
| 957.35838908 | 0.005 |
| 957.52670992 | 0.004 |
| 957.69503198 | 0.005 |
| 957.86335526 | 0.005 |
| 958.03167976 | 0.006 |
| 958.20000548 | 0.004 |
| 958.3683324 | 0.005 |
| 958.53666054 | 0.005 |
| 958.70498988 | 0.006 |
| 958.87332043 | 0.004 |
| 959.04165217 | 0.006 |
| 959.20998511 | 0.003 |
| 959.37831925 | 0.005 |
| 959.54665458 | 0.005 |
| 959.7149911 | 0.007 |
| 959.88332881 | 0.006 |
| 960.05166769 | 0.007 |
| 960.22000776 | 0.006 |
| 960.38834901 | 0.006 |
| 960.55669143 | 0.006 |
| 960.72503502 | 0.006 |
| 960.89337978 | 0.006 |
| 961.06172571 | 0.008 |
| 961.2300728 | 0.004 |
| 961.39842106 | 0.006 |
| 961.56677047 | 0.004 |
| 961.73512103 | 0.006 |
| 961.90347275 | 0.006 |
| 962.07182561 | 0.006 |
| 962.24017962 | 0.003 |
| 962.40853478 | 0.006 |
| 962.57689107 | 0.004 |
| 962.74524851 | 0.005 |
| 962.91360707 | 0.005 |
| 963.08196677 | 0.006 |
| 963.2503276 | 0.005 |
| 963.41868956 | 0.005 |
| 963.58705264 | 0.007 |
| 963.75541683 | 0.005 |
| 963.92378215 | 0.005 |
| 964.09214858 | 0.007 |
| 964.26051612 | 0.005 |
| 964.42888478 | 0.006 |
| 964.59725453 | 0.005 |
| 964.7656254 | 0.007 |
| 964.93399736 | 0.004 |
| 965.10237042 | 0.004 |
| 965.27074457 | 0.006 |
| 965.43911982 | 0.009 |
| 965.60749615 | 0.003 |
| 965.77587357 | 0.006 |
| 965.94425208 | 0.006 |
| 966.11263166 | 0.005 |
| 966.28101233 | 0.004 |
| 966.44939406 | 0.006 |
| 966.61777687 | 0.005 |
| 966.78616075 | 0.006 |
| 966.9545457 | 0.004 |
| 967.1229317 | 0.005 |
| 967.29131877 | 0.005 |
| 967.4597069 | 0.004 |
| 967.62809608 | 0.006 |
| 967.79648631 | 0.006 |
| 967.96487759 | 0.006 |
| 968.13326992 | 0.005 |
| 968.30166329 | 0.004 |
| 968.4700577 | 0.008 |
| 968.63845315 | 0.006 |
| 968.80684963 | 0.007 |
| 968.97524715 | 0.006 |
| 969.14364569 | 0.007 |
| 969.31204527 | 0.006 |
| 969.48044586 | 0.006 |
| 969.64884747 | 0.002 |
| 969.81725011 | 0.006 |
| 969.98565375 | 0.005 |
| 970.15405841 | 0.006 |
| 970.32246408 | 0.005 |
| 970.49087075 | 0.006 |
| 970.65927843 | 0.005 |
| 970.82768711 | 0.005 |
| 970.99609678 | 0.008 |
| 971.16450745 | 0.008 |
| 971.33291912 | 0.003 |
| 971.50133177 | 0.007 |
| 971.6697454 | 0.006 |
| 971.83816002 | 0.005 |
| 972.00657562 | 0.004 |
| 972.1749922 | 0.007 |
| 972.34340976 | 0.004 |
| 972.51182828 | 0.006 |
| 972.68024778 | 0.005 |
| 972.84866824 | 0.006 |
| 973.01708966 | 0.005 |
| 973.18551204 | 0.006 |
| 973.35393538 | 0.005 |
| 973.52235968 | 0.005 |
| 973.69078493 | 0.004 |
| 973.85921113 | 0.006 |
| 974.02763827 | 0.005 |
| 974.19606636 | 0.006 |
| 974.36449538 | 0.005 |
| 974.53292535 | 0.008 |
| 974.70135625 | 0.006 |
| 974.86978808 | 0.006 |
| 975.03822084 | 0.007 |
| 975.20665452 | 0.006 |
| 975.37508913 | 0.005 |
| 975.54352466 | 0.008 |
| 975.71196111 | 0.004 |
| 975.88039847 | 0.006 |
| 976.04883675 | 0.005 |
| 976.21727593 | 0.005 |
| 976.38571602 | 0.005 |
| 976.55415701 | 0.006 |
| 976.72259891 | 0.004 |
| 976.8910417 | 0.007 |
| 977.05948538 | 0.005 |
| 977.22792996 | 0.005 |
| 977.39637542 | 0.005 |
| 977.56482178 | 0.006 |
| 977.73326901 | 0.005 |
| 977.90171713 | 0.006 |
| 978.07016612 | 0.006 |
| 978.23861599 | 0.007 |
| 978.40706673 | 0.003 |
| 978.57551834 | 0.006 |
| 978.74397082 | 0.005 |
| 978.91242415 | 0.005 |
| 979.08087835 | 0.005 |
| 979.24933341 | 0.006 |
| 979.41778932 | 0.005 |
| 979.58624608 | 0.008 |
| 979.7547037 | 0.005 |
| 979.92316215 | 0.006 |
| 980.09162146 | 0.005 |
| 980.2600816 | 0.005 |
| 980.42854258 | 0.005 |
| 980.59700439 | 0.006 |
| 980.76546704 | 0.005 |
| 980.93393051 | 0.007 |
| 981.10239481 | 0.004 |
| 981.27085994 | 0.006 |
| 981.43932588 | 0.004 |
| 981.60779265 | 0.006 |
| 981.77626022 | 0.005 |
| 981.94472861 | 0.006 |
| 982.11319781 | 0.005 |
| 982.28166781 | 0.006 |
| 982.45013862 | 0.006 |
| 982.61861023 | 0.006 |
| 982.78708263 | 0.005 |
| 982.95555583 | 0.007 |
| 983.12402983 | 0.006 |
| 983.29250461 | 0.006 |
| 983.46098017 | 0.005 |
| 983.62945652 | 0.005 |
| 983.79793366 | 0.006 |
| 983.96641156 | 0.005 |
| 984.13489025 | 0.004 |
| 984.3033697 | 0.006 |
| 984.47184993 | 0.006 |
| 984.64033092 | 0.006 |
| 984.80881267 | 0.006 |
| 984.97729518 | 0.006 |
| 985.14577845 | 0.005 |
| 985.31426248 | 0.006 |
| 985.48274726 | 0.005 |
| 985.65123278 | 0.003 |
| 985.81971906 | 0.004 |
| 985.98820607 | 0.008 |
| 986.15669383 | 0.008 |
| 986.32518232 | 0.008 |
| 986.49367155 | 0.006 |
| 986.66216151 | 0.005 |
| 986.8306522 | 0.005 |
| 986.99914362 | 0.007 |
| 987.16763575 | 0.007 |
| 987.33612861 | 0.007 |
| 987.50462219 | 0.005 |
| 987.67311648 | 0.005 |
| 987.84161149 | 0.006 |
| 988.0101072 | 0.006 |
| 988.17860362 | 0.004 |
| 988.34710074 | 0.007 |
| 988.51559856 | 0.005 |
| 988.68409708 | 0.006 |
| 988.85259629 | 0.006 |
| 989.0210962 | 0.006 |
| 989.18959679 | 0.005 |
| 989.35809808 | 0.005 |
| 989.52660004 | 0.004 |
| 989.69510269 | 0.006 |
| 989.86360601 | 0.006 |
| 990.03211 | 0.005 |
| 990.20061467 | 0.005 |
| 990.36912001 | 0.007 |
| 990.53762601 | 0.005 |
| 990.70613268 | 0.005 |
| 990.87464001 | 0.005 |
| 991.04314799 | 0.006 |
| 991.21165663 | 0.006 |
| 991.38016593 | 0.006 |
| 991.54867587 | 0.007 |
| 991.71718645 | 0.006 |
| 991.88569768 | 0.006 |
| 992.05420955 | 0.006 |
| 992.22272206 | 0.005 |
| 992.3912352 | 0.007 |
| 992.55974898 | 0.006 |
| 992.72826338 | 0.006 |
| 992.89677841 | 0.005 |
| 993.06529406 | 0.005 |
| 993.23381034 | 0.005 |
| 993.40232723 | 0.007 |
| 993.57084473 | 0.006 |
| 993.73936285 | 0.005 |
| 993.90788157 | 0.004 |
| 994.07640091 | 0.006 |
| 994.24492084 | 0.005 |
| 994.41344138 | 0.008 |
| 994.58196251 | 0.005 |
| 994.75048424 | 0.006 |
| 994.91900656 | 0.006 |
| 995.08752947 | 0.008 |
| 995.25605296 | 0.006 |
| 995.42457704 | 0.005 |
| 995.5931017 | 0.007 |
| 995.76162693 | 0.005 |
| 995.93015274 | 0.006 |
| 996.09867913 | 0.005 |
| 996.26720608 | 0.004 |
| 996.4357336 | 0.006 |
| 996.60426168 | 0.005 |
| 996.77279032 | 0.007 |
| 996.94131952 | 0.006 |
| 997.10984927 | 0.005 |
| 997.27837957 | 0.006 |
| 997.44691043 | 0.006 |
| 997.61544183 | 0.006 |
| 997.78397377 | 0.005 |
| 997.95250625 | 0.006 |
| 998.12103928 | 0.005 |
| 998.28957283 | 0.006 |
| 998.45810692 | 0.006 |
| 998.62664154 | 0.008 |
| 998.79517668 | 0.005 |
| 998.96371234 | 0.005 |
| 999.13224853 | 0.006 |
| 999.30078523 | 0.006 |
| 999.46932245 | 0.004 |
| 999.63786018 | 0.006 |
| 999.80639842 | 0.005 |
| 999.97493717 | 0.005 |
| 1000.14347642 | 0.006 |
| 1000.31201616 | 0.007 |
| 1000.48055641 | 0.007 |
| 1000.64909715 | 0.006 |
| 1000.81763838 | 0.006 |
| 1000.98618011 | 0.006 |
| 1001.15472231 | 0.007 |
| 1001.323265 | 0.006 |
| 1001.49180818 | 0.005 |
| 1001.66035182 | 0.006 |
| 1001.82889595 | 0.006 |
| 1001.99744054 | 0.006 |
| 1002.16598561 | 0.006 |
| 1002.33453114 | 0.006 |
| 1002.50307713 | 0.005 |
| 1002.67162359 | 0.007 |
| 1002.8401705 | 0.005 |
| 1003.00871786 | 0.006 |
| 1003.17726568 | 0.006 |
| 1003.34581395 | 0.006 |
| 1003.51436266 | 0.005 |
| 1003.68291182 | 0.007 |
| 1003.85146141 | 0.007 |
| 1004.02001145 | 0.005 |
| 1004.18856191 | 0.006 |
| 1004.35711282 | 0.007 |
| 1004.52566414 | 0.006 |
| 1004.6942159 | 0.008 |
| 1004.86276808 | 0.007 |
| 1005.03132068 | 0.008 |
| 1005.19987369 | 0.006 |
| 1005.36842712 | 0.007 |
| 1005.53698097 | 0.004 |
| 1005.70553522 | 0.008 |
| 1005.87408988 | 0.006 |
| 1006.04264494 | 0.006 |
| 1006.2112004 | 0.007 |
| 1006.37975626 | 0.006 |
| 1006.54831251 | 0.006 |
| 1006.71686916 | 0.006 |
| 1006.88542619 | 0.005 |
| 1007.05398361 | 0.007 |
| 1007.22254141 | 0.004 |
| 1007.3910996 | 0.005 |
| 1007.55965816 | 0.004 |
| 1007.7282171 | 0.009 |
| 1007.8967764 | 0.005 |
| 1008.06533608 | 0.006 |
| 1008.23389612 | 0.005 |
| 1008.40245653 | 0.006 |
| 1008.57101729 | 0.006 |
| 1008.73957842 | 0.008 |
| 1008.9081399 | 0.007 |
| 1009.07670173 | 0.006 |
| 1009.24526391 | 0.006 |
| 1009.41382643 | 0.008 |
| 1009.5823893 | 0.007 |
| 1009.75095251 | 0.006 |
| 1009.91951605 | 0.007 |
| 1010.08807993 | 0.007 |
| 1010.25664415 | 0.007 |
| 1010.42520869 | 0.005 |
| 1010.59377356 | 0.008 |
| 1010.76233875 | 0.005 |
| 1010.93090426 | 0.006 |
| 1011.09947009 | 0.005 |
| 1011.26803623 | 0.01 |
| 1011.43660268 | 0.006 |
| 1011.60516945 | 0.005 |
| 1011.77373652 | 0.006 |
| 1011.94230389 | 0.006 |
| 1012.11087156 | 0.006 |
| 1012.27943953 | 0.007 |
| 1012.4480078 | 0.007 |
| 1012.61657636 | 0.006 |
| 1012.7851452 | 0.007 |
| 1012.95371433 | 0.006 |
| 1013.12228375 | 0.006 |
| 1013.29085345 | 0.006 |
| 1013.45942342 | 0.006 |
| 1013.62799367 | 0.006 |
| 1013.79656419 | 0.007 |
| 1013.96513497 | 0.008 |
| 1014.13370603 | 0.005 |
| 1014.30227735 | 0.006 |
| 1014.47084892 | 0.006 |
| 1014.63942076 | 0.006 |
| 1014.80799285 | 0.007 |
| 1014.97656519 | 0.006 |
| 1015.14513778 | 0.006 |
| 1015.31371062 | 0.006 |
| 1015.4822837 | 0.007 |
| 1015.65085702 | 0.006 |
| 1015.81943058 | 0.005 |
| 1015.98800437 | 0.006 |
| 1016.15657839 | 0.006 |
| 1016.32515265 | 0.005 |
| 1016.49372713 | 0.008 |
| 1016.66230183 | 0.005 |
| 1016.83087675 | 0.004 |
| 1016.99945189 | 0.007 |
| 1017.16802725 | 0.006 |
| 1017.33660281 | 0.008 |
| 1017.50517859 | 0.006 |
| 1017.67375457 | 0.007 |
| 1017.84233075 | 0.007 |
| 1018.01090714 | 0.005 |
| 1018.17948372 | 0.007 |
| 1018.3480605 | 0.006 |
| 1018.51663746 | 0.006 |
| 1018.68521462 | 0.005 |
| 1018.85379197 | 0.007 |
| 1019.02236949 | 0.005 |
| 1019.1909472 | 0.006 |
| 1019.35952508 | 0.006 |
| 1019.52810314 | 0.005 |
| 1019.69668137 | 0.005 |
| 1019.86525977 | 0.005 |
| 1020.03383834 | 0.006 |
| 1020.20241707 | 0.006 |
| 1020.37099596 | 0.006 |
| 1020.539575 | 0.008 |
| 1020.7081542 | 0.007 |
| 1020.87673356 | 0.008 |
| 1021.04531306 | 0.007 |
| 1021.21389271 | 0.005 |
| 1021.3824725 | 0.005 |
| 1021.55105243 | 0.005 |
| 1021.7196325 | 0.008 |
| 1021.8882127 | 0.006 |
| 1022.05679304 | 0.005 |
| 1022.2253735 | 0.007 |
| 1022.39395409 | 0.007 |
| 1022.5625348 | 0.008 |
| 1022.73111564 | 0.006 |
| 1022.89969659 | 0.006 |
| 1023.06827765 | 0.006 |
| 1023.23685883 | 0.006 |
| 1023.40544012 | 0.005 |
| 1023.57402151 | 0.007 |
| 1023.74260301 | 0.006 |
| 1023.9111846 | 0.007 |
| 1024.07976629 | 0.005 |
| 1024.24834808 | 0.006 |
| 1024.41692996 | 0.009 |
| 1024.58551193 | 0.007 |
| 1024.75409398 | 0.007 |
| 1024.92267612 | 0.006 |
| 1025.09125834 | 0.006 |
| 1025.25984063 | 0.007 |
| 1025.428423 | 0.005 |
| 1025.59700545 | 0.008 |
| 1025.76558796 | 0.008 |
| 1025.93417053 | 0.006 |
| 1026.10275317 | 0.008 |
| 1026.27133587 | 0.007 |
| 1026.43991863 | 0.01 |
| 1026.60850144 | 0.006 |
| 1026.7770843 | 0.005 |
| 1026.94566722 | 0.006 |
| 1027.11425018 | 0.006 |
| 1027.28283318 | 0.007 |
| 1027.45141622 | 0.007 |
| 1027.6199993 | 0.007 |
| 1027.78858241 | 0.008 |
| 1027.95716556 | 0.008 |
| 1028.12574873 | 0.006 |
| 1028.29433193 | 0.006 |
| 1028.46291516 | 0.007 |
| 1028.6314984 | 0.006 |
| 1028.80008166 | 0.01 |
| 1028.96866494 | 0.008 |
| 1029.13724823 | 0.006 |
| 1029.30583152 | 0.008 |
| 1029.47441482 | 0.007 |
| 1029.64299813 | 0.006 |
| 1029.81158144 | 0.007 |
| 1029.98016474 | 0.007 |
| 1030.14874804 | 0.007 |
| 1030.31733133 | 0.008 |
| 1030.48591461 | 0.006 |
| 1030.65449787 | 0.006 |
| 1030.82308112 | 0.007 |
| 1030.99166435 | 0.006 |
| 1031.16024755 | 0.006 |
| 1031.32883073 | 0.006 |
| 1031.49741388 | 0.006 |
| 1031.665997 | 0.007 |
| 1031.83458009 | 0.005 |
| 1032.00316314 | 0.008 |
| 1032.17174615 | 0.005 |
| 1032.34032912 | 0.007 |
| 1032.50891204 | 0.006 |
| 1032.67749491 | 0.007 |
| 1032.84607774 | 0.006 |
| 1033.0146605 | 0.006 |
| 1033.18324322 | 0.008 |
| 1033.35182587 | 0.006 |
| 1033.52040846 | 0.006 |
| 1033.68899098 | 0.007 |
| 1033.85757344 | 0.01 |
| 1034.02615582 | 0.005 |
| 1034.19473813 | 0.005 |
| 1034.36332036 | 0.008 |
| 1034.53190252 | 0.007 |
| 1034.70048459 | 0.006 |
| 1034.86906658 | 0.007 |
| 1035.03764847 | 0.006 |
| 1035.20623028 | 0.005 |
| 1035.37481199 | 0.008 |
| 1035.54339361 | 0.005 |
| 1035.71197512 | 0.007 |
| 1035.88055654 | 0.006 |
| 1036.04913784 | 0.007 |
| 1036.21771904 | 0.006 |
| 1036.38630013 | 0.005 |
| 1036.55488111 | 0.006 |
| 1036.72346196 | 0.006 |
| 1036.8920427 | 0.007 |
| 1037.06062332 | 0.006 |
| 1037.22920381 | 0.008 |
| 1037.39778417 | 0.006 |
| 1037.5663644 | 0.006 |
| 1037.73494449 | 0.01 |
| 1037.90352445 | 0.009 |
| 1038.07210427 | 0.007 |
| 1038.24068395 | 0.008 |
| 1038.40926348 | 0.005 |
| 1038.57784286 | 0.009 |
| 1038.7464221 | 0.007 |
| 1038.91500117 | 0.01 |
| 1039.08358009 | 0.006 |
| 1039.25215886 | 0.007 |
| 1039.42073745 | 0.006 |
| 1039.58931589 | 0.008 |
| 1039.75789415 | 0.009 |
| 1039.92647225 | 0.007 |
| 1040.09505017 | 0.004 |
| 1040.26362791 | 0.007 |
| 1040.43220547 | 0.005 |
| 1040.60078285 | 0.007 |
| 1040.76936005 | 0.006 |
| 1040.93793705 | 0.006 |
| 1041.10651387 | 0.006 |
| 1041.27509049 | 0.008 |
| 1041.44366692 | 0.008 |
| 1041.61224314 | 0.007 |
| 1041.78081916 | 0.007 |
| 1041.94939498 | 0.009 |
| 1042.11797059 | 0.007 |
| 1042.28654599 | 0.007 |
| 1042.45512117 | 0.008 |
| 1042.62369614 | 0.007 |
| 1042.79227088 | 0.006 |
| 1042.96084541 | 0.008 |
| 1043.12941971 | 0.005 |
| 1043.29799378 | 0.01 |
| 1043.46656762 | 0.007 |
| 1043.63514122 | 0.006 |
| 1043.80371459 | 0.005 |
| 1043.97228772 | 0.007 |
| 1044.1408606 | 0.005 |
| 1044.30943324 | 0.008 |
| 1044.47800564 | 0.007 |
| 1044.64657778 | 0.007 |
| 1044.81514966 | 0.007 |
| 1044.98372129 | 0.006 |
| 1045.15229266 | 0.006 |
| 1045.32086377 | 0.009 |
| 1045.48943461 | 0.007 |
| 1045.65800519 | 0.008 |
| 1045.82657549 | 0.005 |
| 1045.99514552 | 0.01 |
| 1046.16371527 | 0.007 |
| 1046.33228474 | 0.009 |
| 1046.50085393 | 0.007 |
| 1046.66942284 | 0.009 |
| 1046.83799145 | 0.006 |
| 1047.00655978 | 0.007 |
| 1047.17512781 | 0.006 |
| 1047.34369554 | 0.008 |
| 1047.51226297 | 0.008 |
| 1047.6808301 | 0.008 |
| 1047.84939693 | 0.007 |
| 1048.01796345 | 0.01 |
| 1048.18652965 | 0.007 |
| 1048.35509554 | 0.008 |
| 1048.52366112 | 0.007 |
| 1048.69222637 | 0.007 |
| 1048.86079131 | 0.007 |
| 1049.02935591 | 0.007 |
| 1049.19792019 | 0.008 |
| 1049.36648414 | 0.008 |
| 1049.53504775 | 0.006 |
| 1049.70361103 | 0.009 |
| 1049.87217397 | 0.008 |
| 1050.04073656 | 0.008 |
| 1050.20929881 | 0.005 |
| 1050.37786071 | 0.01 |
| 1050.54642226 | 0.006 |
| 1050.71498346 | 0.009 |
| 1050.88354429 | 0.008 |
| 1051.05210477 | 0.009 |
| 1051.22066489 | 0.006 |
| 1051.38922464 | 0.009 |
| 1051.55778402 | 0.006 |
| 1051.72634303 | 0.009 |
| 1051.89490167 | 0.006 |
| 1052.06345993 | 0.007 |
| 1052.23201781 | 0.01 |
| 1052.40057531 | 0.007 |
| 1052.56913242 | 0.006 |
| 1052.73768914 | 0.007 |
| 1052.90624548 | 0.011 |
| 1053.07480141 | 0.009 |
| 1053.24335696 | 0.01 |
| 1053.4119121 | 0.007 |
| 1053.58046684 | 0.006 |
| 1053.74902117 | 0.006 |
| 1053.9175751 | 0.009 |
| 1054.08612861 | 0.008 |
| 1054.25468171 | 0.008 |
| 1054.42323439 | 0.006 |
| 1054.59178666 | 0.007 |
| 1054.7603385 | 0.009 |
| 1054.92888991 | 0.006 |
| 1055.0974409 | 0.009 |
| 1055.26599145 | 0.007 |
| 1055.43454158 | 0.007 |
| 1055.60309126 | 0.01 |
| 1055.7716405 | 0.01 |
| 1055.94018931 | 0.006 |
| 1056.10873766 | 0.009 |
| 1056.27728557 | 0.006 |
| 1056.44583303 | 0.008 |
| 1056.61438003 | 0.009 |
| 1056.78292658 | 0.007 |
| 1056.95147266 | 0.006 |
| 1057.12001829 | 0.009 |
| 1057.28856345 | 0.009 |
| 1057.45710814 | 0.007 |
| 1057.62565235 | 0.009 |
| 1057.7941961 | 0.008 |
| 1057.96273937 | 0.007 |
| 1058.13128215 | 0.008 |
| 1058.29982446 | 0.007 |
| 1058.46836628 | 0.008 |
| 1058.63690761 | 0.007 |
| 1058.80544845 | 0.007 |
| 1058.9739888 | 0.006 |
| 1059.14252865 | 0.008 |
| 1059.311068 | 0.004 |
| 1059.47960684 | 0.008 |
| 1059.64814518 | 0.006 |
| 1059.81668302 | 0.006 |
| 1059.98522034 | 0.007 |
| 1060.15375714 | 0.007 |
| 1060.32229344 | 0.006 |
| 1060.49082921 | 0.009 |
| 1060.65936445 | 0.011 |
| 1060.82789918 | 0.01 |
| 1060.99643337 | 0.008 |
| 1061.16496703 | 0.008 |
| 1061.33350016 | 0.011 |
| 1061.50203275 | 0.011 |
| 1061.67056481 | 0.009 |
| 1061.83909632 | 0.011 |
| 1062.00762728 | 0.007 |
| 1062.1761577 | 0.009 |
| 1062.34468756 | 0.011 |
| 1062.51321687 | 0.011 |
| 1062.68174562 | 0.01 |
| 1062.85027382 | 0.009 |
| 1063.01880145 | 0.008 |
| 1063.18732851 | 0.01 |
| 1063.35585501 | 0.008 |
| 1063.52438094 | 0.011 |
| 1063.69290629 | 0.008 |
| 1063.86143106 | 0.009 |
| 1064.02995526 | 0.01 |
| 1064.19847887 | 0.013 |
| 1064.3670019 | 0.011 |
| 1064.53552433 | 0.012 |
| 1064.70404618 | 0.011 |
| 1064.87256744 | 0.009 |
| 1065.04108809 | 0.013 |
| 1065.20960815 | 0.01 |
| 1065.3781276 | 0.013 |
| 1065.54664645 | 0.013 |
| 1065.71516469 | 0.015 |
| 1065.88368232 | 0.01 |
| 1066.05219933 | 0.011 |
| 1066.22071573 | 0.013 |
| 1066.38923151 | 0.014 |
| 1066.55774666 | 0.014 |
| 1066.72626119 | 0.012 |
| 1066.89477509 | 0.015 |
| 1067.06328836 | 0.016 |
| 1067.231801 | 0.015 |
| 1067.400313 | 0.016 |
| 1067.56882436 | 0.015 |
| 1067.73733507 | 0.016 |
| 1067.90584514 | 0.015 |
| 1068.07435456 | 0.016 |
| 1068.24286334 | 0.014 |
| 1068.41137145 | 0.016 |
| 1068.57987891 | 0.014 |
| 1068.74838571 | 0.016 |
| 1068.91689185 | 0.014 |
| 1069.08539732 | 0.016 |
| 1069.25390213 | 0.014 |
| 1069.42240626 | 0.015 |
| 1069.59090972 | 0.014 |
| 1069.7594125 | 0.016 |
| 1069.9279146 | 0.014 |
| 1070.09641602 | 0.015 |
| 1070.26491675 | 0.014 |
| 1070.4334168 | 0.016 |
| 1070.60191615 | 0.015 |
| 1070.77041481 | 0.016 |
| 1070.93891277 | 0.013 |
| 1071.10741003 | 0.015 |
| 1071.27590659 | 0.013 |
| 1071.44440245 | 0.016 |
| 1071.6128976 | 0.015 |
| 1071.78139203 | 0.016 |
| 1071.94988575 | 0.014 |
| 1072.11837875 | 0.016 |
| 1072.28687104 | 0.015 |
| 1072.4553626 | 0.016 |
| 1072.62385344 | 0.015 |
| 1072.79234354 | 0.016 |
| 1072.96083292 | 0.014 |
| 1073.12932156 | 0.015 |
| 1073.29780947 | 0.014 |
| 1073.46629663 | 0.015 |
| 1073.63478305 | 0.014 |
| 1073.80326873 | 0.016 |
| 1073.97175366 | 0.014 |
| 1074.14023784 | 0.015 |
| 1074.30872126 | 0.014 |
| 1074.47720393 | 0.016 |
| 1074.64568583 | 0.014 |
| 1074.81416697 | 0.016 |
| 1074.98264735 | 0.015 |
| 1075.15112696 | 0.016 |
| 1075.3196058 | 0.015 |
| 1075.48808387 | 0.016 |
| 1075.65656115 | 0.015 |
| 1075.82503766 | 0.016 |
| 1075.99351338 | 0.015 |
| 1076.16198832 | 0.016 |
| 1076.33046247 | 0.014 |
| 1076.49893583 | 0.016 |
| 1076.6674084 | 0.014 |
| 1076.83588017 | 0.016 |
| 1077.00435114 | 0.015 |
| 1077.1728213 | 0.016 |
| 1077.34129066 | 0.015 |
| 1077.50975922 | 0.016 |
| 1077.67822696 | 0.014 |
| 1077.84669388 | 0.016 |
| 1078.01515999 | 0.014 |
| 1078.18362528 | 0.016 |
| 1078.35208975 | 0.014 |
| 1078.52055339 | 0.016 |
| 1078.6890162 | 0.015 |
| 1078.85747818 | 0.016 |
| 1079.02593933 | 0.016 |
| 1079.19439964 | 0.016 |
| 1079.36285911 | 0.014 |
| 1079.53131774 | 0.016 |
| 1079.69977552 | 0.015 |
| 1079.86823246 | 0.016 |
| 1080.03668854 | 0.014 |
| 1080.20514377 | 0.016 |
| 1080.37359814 | 0.015 |
| 1080.54205165 | 0.016 |
| 1080.7105043 | 0.015 |
| 1080.87895609 | 0.016 |
| 1081.047407 | 0.016 |
| 1081.21585705 | 0.014 |
| 1081.38430622 | 0.016 |
| 1081.55275451 | 0.014 |
| 1081.72120192 | 0.016 |
| 1081.88964845 | 0.014 |
| 1082.0580941 | 0.016 |
| 1082.22653885 | 0.014 |
| 1082.39498272 | 0.016 |
| 1082.56342569 | 0.014 |
| 1082.73186776 | 0.016 |
| 1082.90030894 | 0.014 |
| 1083.06874921 | 0.016 |
| 1083.23718857 | 0.014 |
| 1083.40562703 | 0.016 |
| 1083.57406458 | 0.014 |
| 1083.74250121 | 0.016 |
| 1083.91093692 | 0.014 |
| 1084.07937172 | 0.016 |
| 1084.24780559 | 0.014 |
| 1084.41623854 | 0.016 |
| 1084.58467055 | 0.015 |
| 1084.75310164 | 0.016 |
| 1084.92153179 | 0.013 |
| 1085.08996101 | 0.016 |
| 1085.25838929 | 0.014 |
| 1085.42681662 | 0.016 |
| 1085.59524301 | 0.015 |
| 1085.76366844 | 0.016 |
| 1085.93209293 | 0.015 |
| 1086.10051647 | 0.016 |
| 1086.26893904 | 0.014 |
| 1086.43736066 | 0.016 |
| 1086.60578131 | 0.014 |
| 1086.774201 | 0.016 |
| 1086.94261972 | 0.014 |
| 1087.11103747 | 0.016 |
| 1087.27945425 | 0.015 |
| 1087.44787004 | 0.016 |
| 1087.61628486 | 0.014 |
| 1087.7846987 | 0.016 |
| 1087.95311155 | 0.014 |
| 1088.12152341 | 0.016 |
| 1088.28993428 | 0.013 |
| 1088.45834415 | 0.016 |
| 1088.62675303 | 0.014 |
| 1088.79516091 | 0.016 |
| 1088.96356779 | 0.013 |
| 1089.13197366 | 0.016 |
| 1089.30037852 | 0.014 |
| 1089.46878237 | 0.016 |
| 1089.63718521 | 0.013 |
| 1089.80558702 | 0.016 |
| 1089.97398782 | 0.014 |
| 1090.1423876 | 0.016 |
| 1090.31078635 | 0.014 |
| 1090.47918408 | 0.016 |
| 1090.64758077 | 0.015 |
| 1090.81597642 | 0.016 |
| 1090.98437104 | 0.014 |
| 1091.15276462 | 0.016 |
| 1091.32115716 | 0.015 |
| 1091.48954865 | 0.016 |
| 1091.6579391 | 0.014 |
| 1091.82632849 | 0.016 |
| 1091.99471683 | 0.014 |
| 1092.16310411 | 0.016 |
| 1092.33149033 | 0.014 |
| 1092.49987549 | 0.016 |
| 1092.66825958 | 0.015 |
| 1092.83664261 | 0.016 |
| 1093.00502456 | 0.015 |
| 1093.17340544 | 0.016 |
| 1093.34178524 | 0.015 |
| 1093.51016396 | 0.016 |
| 1093.6785416 | 0.014 |
| 1093.84691816 | 0.016 |
| 1094.01529362 | 0.014 |
| 1094.183668 | 0.016 |
| 1094.35204128 | 0.014 |
| 1094.52041346 | 0.016 |
| 1094.68878454 | 0.014 |
| 1094.85715452 | 0.016 |
| 1095.0255234 | 0.014 |
| 1095.19389116 | 0.016 |
| 1095.36225782 | 0.014 |
| 1095.53062336 | 0.016 |
| 1095.69898778 | 0.014 |
| 1095.86735109 | 0.016 |
| 1096.03571327 | 0.01 |
| 1096.20407432 | 0 |
| 1096.37243425 | 0 |
| 1096.54079304 | 0 |
| 1096.70915071 | 0 |
| 1096.87750723 | 0 |
| 1097.04586261 | 0.001 |